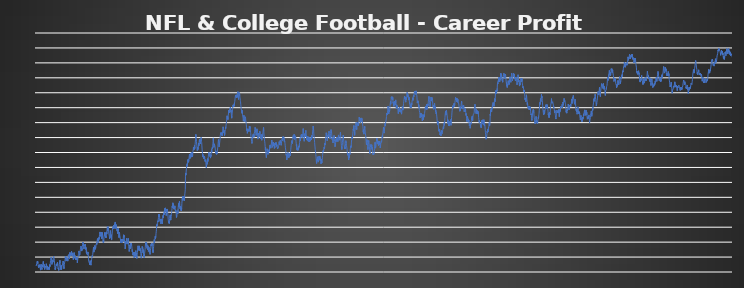
| Category | career profit |
|---|---|
| 0 | 0 |
| 1 | -1100 |
| 2 | 900 |
| 3 | 3900 |
| 4 | 5900 |
| 5 | 5900 |
| 6 | 7900 |
| 7 | 4600 |
| 8 | 7600 |
| 9 | 5400 |
| 10 | 2100 |
| 11 | -900 |
| 12 | -900 |
| 13 | -2900 |
| 14 | -1990.91 |
| 15 | 1645.45 |
| 16 | -854.55 |
| 17 | 2145.45 |
| 18 | -1154.55 |
| 19 | 845.45 |
| 20 | -2454.55 |
| 21 | -3554.55 |
| 22 | -6854.55 |
| 23 | -2854.55 |
| 24 | 1145.45 |
| 25 | 3145.45 |
| 26 | -154.55 |
| 27 | 845.45 |
| 28 | -3554.55 |
| 29 | -6054.55 |
| 30 | -3054.55 |
| 31 | 945.45 |
| 32 | -1254.55 |
| 33 | 1745.45 |
| 34 | 2745.45 |
| 35 | 5745.45 |
| 36 | 7745.45 |
| 37 | 3345.45 |
| 38 | 1145.45 |
| 39 | -2354.55 |
| 40 | -536.37 |
| 41 | 2645.45 |
| 42 | -1854.55 |
| 43 | -5854.55 |
| 44 | -3581.82 |
| 45 | -1763.64 |
| 46 | 54.54 |
| 47 | -1045.46 |
| 48 | -45.46 |
| 49 | -2545.46 |
| 50 | 181.81 |
| 51 | 3818.17 |
| 52 | 818.17 |
| 53 | -181.83 |
| 54 | -3181.83 |
| 55 | -6181.83 |
| 56 | -2090.92 |
| 57 | 181.81 |
| 58 | 1545.45 |
| 59 | -1454.55 |
| 60 | -5454.55 |
| 61 | -1818.19 |
| 62 | -4818.19 |
| 63 | -1636.37 |
| 64 | -3136.37 |
| 65 | -6136.37 |
| 66 | -5227.28 |
| 67 | -1590.92 |
| 68 | 2499.99 |
| 69 | -1000.01 |
| 70 | 2049.99 |
| 71 | 4658.69 |
| 72 | 9204.14 |
| 73 | 9204.14 |
| 74 | 10567.78 |
| 75 | 14658.69 |
| 76 | 13658.69 |
| 77 | 10158.69 |
| 78 | 6658.69 |
| 79 | 2658.69 |
| 80 | 5385.96 |
| 81 | 8429.44 |
| 82 | 5929.44 |
| 83 | 9565.8 |
| 84 | 6565.8 |
| 85 | 11111.25 |
| 86 | 14920.77 |
| 87 | 13420.77 |
| 88 | 16602.59 |
| 89 | 17511.68 |
| 90 | 12511.68 |
| 91 | 9511.68 |
| 92 | 5011.68 |
| 93 | 1011.68 |
| 94 | -1988.32 |
| 95 | -5988.32 |
| 96 | -3715.59 |
| 97 | -5715.59 |
| 98 | -1624.68 |
| 99 | -624.68 |
| 100 | -624.68 |
| 101 | 3011.68 |
| 102 | 4375.32 |
| 103 | 375.32 |
| 104 | 1738.96 |
| 105 | 4466.23 |
| 106 | 5466.23 |
| 107 | 6375.32 |
| 108 | 1375.32 |
| 109 | -1924.68 |
| 110 | -4924.68 |
| 111 | -5424.68 |
| 112 | -3224.68 |
| 113 | -7224.68 |
| 114 | -4497.41 |
| 115 | -1315.59 |
| 116 | 2775.32 |
| 117 | 3684.41 |
| 118 | 6866.23 |
| 119 | 9593.5 |
| 120 | 4593.5 |
| 121 | 1093.5 |
| 122 | -1906.5 |
| 123 | -5906.5 |
| 124 | -2724.68 |
| 125 | 1366.23 |
| 126 | -2633.77 |
| 127 | -6133.77 |
| 128 | -2497.41 |
| 129 | -697.41 |
| 130 | -1197.41 |
| 131 | 1802.59 |
| 132 | 802.59 |
| 133 | 1802.59 |
| 134 | 5893.5 |
| 135 | 8393.5 |
| 136 | 4393.5 |
| 137 | 1393.5 |
| 138 | 393.5 |
| 139 | -4606.5 |
| 140 | -796.98 |
| 141 | 2384.84 |
| 142 | 5269.46 |
| 143 | 4169.46 |
| 144 | 7943.04 |
| 145 | 12033.95 |
| 146 | 15670.31 |
| 147 | 12670.31 |
| 148 | 15852.13 |
| 149 | 11852.13 |
| 150 | 8352.13 |
| 151 | 11079.4 |
| 152 | 10079.4 |
| 153 | 14104.4 |
| 154 | 9604.4 |
| 155 | 12521.07 |
| 156 | 9521.07 |
| 157 | 12248.34 |
| 158 | 8248.34 |
| 159 | 11884.7 |
| 160 | 14611.97 |
| 161 | 17793.79 |
| 162 | 15293.79 |
| 163 | 18997.49 |
| 164 | 16997.49 |
| 165 | 15497.49 |
| 166 | 11997.49 |
| 167 | 16088.4 |
| 168 | 19724.76 |
| 169 | 22906.58 |
| 170 | 18406.58 |
| 171 | 21588.4 |
| 172 | 17588.4 |
| 173 | 20392.14 |
| 174 | 21301.23 |
| 175 | 17801.23 |
| 176 | 20801.23 |
| 177 | 24892.14 |
| 178 | 20392.14 |
| 179 | 17892.14 |
| 180 | 21983.05 |
| 181 | 20983.05 |
| 182 | 17483.05 |
| 183 | 21119.41 |
| 184 | 17119.41 |
| 185 | 13619.41 |
| 186 | 10619.41 |
| 187 | 15164.86 |
| 188 | 16528.5 |
| 189 | 18478.5 |
| 190 | 22569.41 |
| 191 | 18069.41 |
| 192 | 14769.41 |
| 193 | 18405.77 |
| 194 | 14405.77 |
| 195 | 12405.77 |
| 196 | 16496.68 |
| 197 | 13496.68 |
| 198 | 10496.68 |
| 199 | 14133.04 |
| 200 | 11133.04 |
| 201 | 14314.86 |
| 202 | 14314.86 |
| 203 | 10314.86 |
| 204 | 14405.77 |
| 205 | 10005.77 |
| 206 | 5505.77 |
| 207 | 8687.59 |
| 208 | 10137.59 |
| 209 | 12657.59 |
| 210 | 15657.59 |
| 211 | 18990.92 |
| 212 | 17990.92 |
| 213 | 21172.74 |
| 214 | 25263.65 |
| 215 | 22263.65 |
| 216 | 22263.65 |
| 217 | 17863.65 |
| 218 | 16863.65 |
| 219 | 20500.01 |
| 220 | 24136.37 |
| 221 | 27318.19 |
| 222 | 27318.19 |
| 223 | 30318.19 |
| 224 | 33318.19 |
| 225 | 34518.19 |
| 226 | 29518.19 |
| 227 | 25018.19 |
| 228 | 28684.86 |
| 229 | 26184.86 |
| 230 | 30275.77 |
| 231 | 33457.59 |
| 232 | 32457.59 |
| 233 | 36062.59 |
| 234 | 40153.5 |
| 235 | 36853.5 |
| 236 | 33353.5 |
| 237 | 36853.5 |
| 238 | 32853.5 |
| 239 | 28353.5 |
| 240 | 32353.5 |
| 241 | 33717.14 |
| 242 | 33717.14 |
| 243 | 31717.14 |
| 244 | 35808.05 |
| 245 | 33608.05 |
| 246 | 36789.87 |
| 247 | 32289.87 |
| 248 | 27889.87 |
| 249 | 31071.69 |
| 250 | 26571.69 |
| 251 | 22571.69 |
| 252 | 25753.51 |
| 253 | 20253.51 |
| 254 | 21253.51 |
| 255 | 20253.51 |
| 256 | 19253.51 |
| 257 | 18253.51 |
| 258 | 20526.24 |
| 259 | 23526.24 |
| 260 | 20226.24 |
| 261 | 16226.24 |
| 262 | 12226.24 |
| 263 | 7826.24 |
| 264 | 6726.24 |
| 265 | 8998.97 |
| 266 | 7398.97 |
| 267 | 4098.97 |
| 268 | 1898.97 |
| 269 | 5898.97 |
| 270 | 9080.79 |
| 271 | 4580.79 |
| 272 | 4580.79 |
| 273 | 5830.79 |
| 274 | 1430.79 |
| 275 | 4430.79 |
| 276 | 6703.52 |
| 277 | 10703.52 |
| 278 | 11703.52 |
| 279 | 14430.79 |
| 280 | 17430.79 |
| 281 | 15430.79 |
| 282 | 17430.79 |
| 283 | 19430.79 |
| 284 | 23430.79 |
| 285 | 26612.61 |
| 286 | 27612.61 |
| 287 | 31612.61 |
| 288 | 27612.61 |
| 289 | 23212.61 |
| 290 | 27212.61 |
| 291 | 28212.61 |
| 292 | 31394.43 |
| 293 | 34394.43 |
| 294 | 32194.43 |
| 295 | 27694.43 |
| 296 | 31694.43 |
| 297 | 29694.43 |
| 298 | 32694.43 |
| 299 | 32694.43 |
| 300 | 36361.1 |
| 301 | 35261.1 |
| 302 | 38261.1 |
| 303 | 36061.1 |
| 304 | 40061.1 |
| 305 | 42977.77 |
| 306 | 43977.77 |
| 307 | 46061.1 |
| 308 | 41661.1 |
| 309 | 44661.1 |
| 310 | 41361.1 |
| 311 | 39161.1 |
| 312 | 42494.43 |
| 313 | 47494.43 |
| 314 | 44494.43 |
| 315 | 45694.43 |
| 316 | 49027.76 |
| 317 | 53027.76 |
| 318 | 53027.76 |
| 319 | 57027.76 |
| 320 | 53027.76 |
| 321 | 51927.76 |
| 322 | 49727.76 |
| 323 | 48227.76 |
| 324 | 53227.76 |
| 325 | 56864.12 |
| 326 | 53864.12 |
| 327 | 48864.12 |
| 328 | 45564.12 |
| 329 | 49564.12 |
| 330 | 52564.12 |
| 331 | 56200.48 |
| 332 | 51800.48 |
| 333 | 46800.48 |
| 334 | 43500.48 |
| 335 | 39500.48 |
| 336 | 42500.48 |
| 337 | 39200.48 |
| 338 | 43200.48 |
| 339 | 47745.93 |
| 340 | 48745.93 |
| 341 | 52382.29 |
| 342 | 55382.29 |
| 343 | 51382.29 |
| 344 | 56382.29 |
| 345 | 52882.29 |
| 346 | 48482.29 |
| 347 | 47482.29 |
| 348 | 50482.29 |
| 349 | 46982.29 |
| 350 | 50982.29 |
| 351 | 53982.29 |
| 352 | 55982.29 |
| 353 | 53482.29 |
| 354 | 58027.74 |
| 355 | 62027.74 |
| 356 | 65027.74 |
| 357 | 59527.74 |
| 358 | 63164.1 |
| 359 | 66164.1 |
| 360 | 61764.1 |
| 361 | 64764.1 |
| 362 | 60364.1 |
| 363 | 54864.1 |
| 364 | 53864.1 |
| 365 | 51664.1 |
| 366 | 49464.1 |
| 367 | 45464.1 |
| 368 | 48380.77 |
| 369 | 51380.77 |
| 370 | 55380.77 |
| 371 | 59380.77 |
| 372 | 56080.77 |
| 373 | 51680.77 |
| 374 | 47280.77 |
| 375 | 52280.77 |
| 376 | 48280.77 |
| 377 | 43480.77 |
| 378 | 47480.77 |
| 379 | 51480.77 |
| 380 | 55117.13 |
| 381 | 60117.13 |
| 382 | 58617.13 |
| 383 | 62253.49 |
| 384 | 65889.85 |
| 385 | 62389.85 |
| 386 | 64208.03 |
| 387 | 68408.03 |
| 388 | 63908.03 |
| 389 | 67908.03 |
| 390 | 62908.03 |
| 391 | 66908.03 |
| 392 | 70544.39 |
| 393 | 67244.39 |
| 394 | 70577.72 |
| 395 | 73759.54 |
| 396 | 69259.54 |
| 397 | 67059.54 |
| 398 | 62659.54 |
| 399 | 66295.9 |
| 400 | 65295.9 |
| 401 | 69295.9 |
| 402 | 65795.9 |
| 403 | 61395.9 |
| 404 | 59395.9 |
| 405 | 61395.9 |
| 406 | 58095.9 |
| 407 | 54095.9 |
| 408 | 57732.26 |
| 409 | 61368.62 |
| 410 | 63368.62 |
| 411 | 57868.62 |
| 412 | 56868.62 |
| 413 | 51868.62 |
| 414 | 47468.62 |
| 415 | 52468.62 |
| 416 | 56468.62 |
| 417 | 53968.62 |
| 418 | 50968.62 |
| 419 | 50968.62 |
| 420 | 46568.62 |
| 421 | 46568.62 |
| 422 | 43268.62 |
| 423 | 38868.62 |
| 424 | 42868.62 |
| 425 | 38868.62 |
| 426 | 41868.62 |
| 427 | 44868.62 |
| 428 | 39868.62 |
| 429 | 44868.62 |
| 430 | 43868.62 |
| 431 | 39468.62 |
| 432 | 41468.62 |
| 433 | 44468.62 |
| 434 | 41168.62 |
| 435 | 45168.62 |
| 436 | 49335.29 |
| 437 | 52335.29 |
| 438 | 47935.29 |
| 439 | 51571.65 |
| 440 | 47721.65 |
| 441 | 43721.65 |
| 442 | 39721.65 |
| 443 | 37521.65 |
| 444 | 33121.65 |
| 445 | 28721.65 |
| 446 | 31721.65 |
| 447 | 36721.65 |
| 448 | 41721.65 |
| 449 | 37221.65 |
| 450 | 40221.65 |
| 451 | 43403.47 |
| 452 | 46403.47 |
| 453 | 42003.47 |
| 454 | 42003.47 |
| 455 | 36503.47 |
| 456 | 35503.47 |
| 457 | 36503.47 |
| 458 | 38503.47 |
| 459 | 43503.47 |
| 460 | 46503.47 |
| 461 | 42103.47 |
| 462 | 36603.47 |
| 463 | 32203.47 |
| 464 | 28903.47 |
| 465 | 24403.47 |
| 466 | 27403.47 |
| 467 | 32403.47 |
| 468 | 35403.47 |
| 469 | 31903.47 |
| 470 | 28603.47 |
| 471 | 32603.47 |
| 472 | 35103.47 |
| 473 | 38436.8 |
| 474 | 34436.8 |
| 475 | 33436.8 |
| 476 | 38436.8 |
| 477 | 35136.8 |
| 478 | 34036.8 |
| 479 | 29036.8 |
| 480 | 24036.8 |
| 481 | 27036.8 |
| 482 | 22636.8 |
| 483 | 18236.8 |
| 484 | 19236.8 |
| 485 | 19236.8 |
| 486 | 18136.8 |
| 487 | 23136.8 |
| 488 | 18136.8 |
| 489 | 17136.8 |
| 490 | 13836.8 |
| 491 | 17836.8 |
| 492 | 21473.16 |
| 493 | 23473.16 |
| 494 | 19473.16 |
| 495 | 15073.16 |
| 496 | 20073.16 |
| 497 | 22800.43 |
| 498 | 25800.43 |
| 499 | 20800.43 |
| 500 | 18600.43 |
| 501 | 21600.43 |
| 502 | 17200.43 |
| 503 | 12700.43 |
| 504 | 15700.43 |
| 505 | 19700.43 |
| 506 | 22800.43 |
| 507 | 26800.43 |
| 508 | 30800.43 |
| 509 | 33800.43 |
| 510 | 28300.43 |
| 511 | 26300.43 |
| 512 | 30300.43 |
| 513 | 27000.43 |
| 514 | 30750.43 |
| 515 | 33750.43 |
| 516 | 29350.43 |
| 517 | 25750.43 |
| 518 | 30295.88 |
| 519 | 28095.88 |
| 520 | 25595.88 |
| 521 | 28595.88 |
| 522 | 24195.88 |
| 523 | 20895.88 |
| 524 | 17595.88 |
| 525 | 13195.88 |
| 526 | 17195.88 |
| 527 | 21195.88 |
| 528 | 24195.88 |
| 529 | 27832.24 |
| 530 | 32832.24 |
| 531 | 28432.24 |
| 532 | 31432.24 |
| 533 | 27832.24 |
| 534 | 22332.24 |
| 535 | 27332.24 |
| 536 | 21832.24 |
| 537 | 19832.24 |
| 538 | 14832.24 |
| 539 | 18832.24 |
| 540 | 14432.24 |
| 541 | 18432.24 |
| 542 | 21614.06 |
| 543 | 22614.06 |
| 544 | 27197.39 |
| 545 | 30833.75 |
| 546 | 35833.75 |
| 547 | 38833.75 |
| 548 | 35533.75 |
| 549 | 40117.08 |
| 550 | 37917.08 |
| 551 | 33517.08 |
| 552 | 38100.41 |
| 553 | 34800.41 |
| 554 | 29580.41 |
| 555 | 34580.41 |
| 556 | 31280.41 |
| 557 | 26880.41 |
| 558 | 30880.41 |
| 559 | 33880.41 |
| 560 | 28380.41 |
| 561 | 24380.41 |
| 562 | 25380.41 |
| 563 | 28380.41 |
| 564 | 31297.08 |
| 565 | 27297.08 |
| 566 | 22897.08 |
| 567 | 26897.08 |
| 568 | 23897.08 |
| 569 | 19497.08 |
| 570 | 22497.08 |
| 571 | 26306.6 |
| 572 | 29223.27 |
| 573 | 31723.27 |
| 574 | 36268.72 |
| 575 | 33768.72 |
| 576 | 35132.36 |
| 577 | 38282.36 |
| 578 | 34982.36 |
| 579 | 37709.63 |
| 580 | 33709.63 |
| 581 | 28209.63 |
| 582 | 24909.63 |
| 583 | 26909.63 |
| 584 | 22409.63 |
| 585 | 26409.63 |
| 586 | 28809.63 |
| 587 | 32809.63 |
| 588 | 37159.63 |
| 589 | 40492.96 |
| 590 | 44242.96 |
| 591 | 38742.96 |
| 592 | 41351.66 |
| 593 | 44351.66 |
| 594 | 46434.99 |
| 595 | 49768.32 |
| 596 | 45268.32 |
| 597 | 46268.32 |
| 598 | 49601.65 |
| 599 | 54601.65 |
| 600 | 57351.65 |
| 601 | 61351.65 |
| 602 | 65264.69 |
| 603 | 69264.69 |
| 604 | 66764.69 |
| 605 | 70401.05 |
| 606 | 72401.05 |
| 607 | 75401.05 |
| 608 | 76851.05 |
| 609 | 73551.05 |
| 610 | 77551.05 |
| 611 | 80951.05 |
| 612 | 85951.05 |
| 613 | 82651.05 |
| 614 | 87051.05 |
| 615 | 83751.05 |
| 616 | 85751.05 |
| 617 | 81351.05 |
| 618 | 76851.05 |
| 619 | 74651.05 |
| 620 | 78564.09 |
| 621 | 80064.09 |
| 622 | 76064.09 |
| 623 | 70564.09 |
| 624 | 69564.09 |
| 625 | 73655 |
| 626 | 72555 |
| 627 | 75282.27 |
| 628 | 78918.63 |
| 629 | 74918.63 |
| 630 | 70418.63 |
| 631 | 75001.96 |
| 632 | 77085.29 |
| 633 | 80721.65 |
| 634 | 84721.65 |
| 635 | 80721.65 |
| 636 | 84471.65 |
| 637 | 86871.65 |
| 638 | 88871.65 |
| 639 | 85571.65 |
| 640 | 90117.1 |
| 641 | 91367.1 |
| 642 | 96367.1 |
| 643 | 94867.1 |
| 644 | 90367.1 |
| 645 | 95367.1 |
| 646 | 97367.1 |
| 647 | 92967.1 |
| 648 | 91967.1 |
| 649 | 88467.1 |
| 650 | 84467.1 |
| 651 | 88467.1 |
| 652 | 92380.14 |
| 653 | 94880.14 |
| 654 | 90480.14 |
| 655 | 95480.14 |
| 656 | 91980.14 |
| 657 | 90880.14 |
| 658 | 86880.14 |
| 659 | 81880.14 |
| 660 | 77480.14 |
| 661 | 76480.14 |
| 662 | 72080.14 |
| 663 | 72080.14 |
| 664 | 75080.14 |
| 665 | 71080.14 |
| 666 | 75663.47 |
| 667 | 79737.54 |
| 668 | 83737.54 |
| 669 | 83737.54 |
| 670 | 85737.54 |
| 671 | 80237.54 |
| 672 | 76737.54 |
| 673 | 75637.54 |
| 674 | 78970.87 |
| 675 | 83070.87 |
| 676 | 86070.87 |
| 677 | 89707.23 |
| 678 | 93507.23 |
| 679 | 96507.23 |
| 680 | 100507.23 |
| 681 | 97207.23 |
| 682 | 102207.23 |
| 683 | 105843.59 |
| 684 | 104743.59 |
| 685 | 100343.59 |
| 686 | 104093.59 |
| 687 | 99693.59 |
| 688 | 95693.59 |
| 689 | 99443.59 |
| 690 | 95043.59 |
| 691 | 95043.59 |
| 692 | 97043.59 |
| 693 | 100679.95 |
| 694 | 97379.95 |
| 695 | 96379.95 |
| 696 | 90879.95 |
| 697 | 93879.95 |
| 698 | 95429.95 |
| 699 | 91029.95 |
| 700 | 85529.95 |
| 701 | 81229.95 |
| 702 | 80229.95 |
| 703 | 84229.95 |
| 704 | 88229.95 |
| 705 | 92229.95 |
| 706 | 87229.95 |
| 707 | 91229.95 |
| 708 | 87929.95 |
| 709 | 94929.95 |
| 710 | 98929.95 |
| 711 | 102111.77 |
| 712 | 104839.04 |
| 713 | 99339.04 |
| 714 | 102672.37 |
| 715 | 106672.37 |
| 716 | 108572.37 |
| 717 | 105272.37 |
| 718 | 101272.37 |
| 719 | 95772.37 |
| 720 | 99772.37 |
| 721 | 95372.37 |
| 722 | 99372.37 |
| 723 | 98372.37 |
| 724 | 92872.37 |
| 725 | 96872.37 |
| 726 | 92472.37 |
| 727 | 97017.82 |
| 728 | 104317.82 |
| 729 | 109317.82 |
| 730 | 113317.82 |
| 731 | 110017.82 |
| 732 | 113017.82 |
| 733 | 117017.82 |
| 734 | 112617.82 |
| 735 | 116254.18 |
| 736 | 112954.18 |
| 737 | 115954.18 |
| 738 | 110454.18 |
| 739 | 113454.18 |
| 740 | 108954.18 |
| 741 | 112954.18 |
| 742 | 116954.18 |
| 743 | 120954.18 |
| 744 | 123954.18 |
| 745 | 127954.18 |
| 746 | 150454.18 |
| 747 | 155454.18 |
| 748 | 152154.18 |
| 749 | 156154.18 |
| 750 | 160699.63 |
| 751 | 163699.63 |
| 752 | 166219.63 |
| 753 | 167219.63 |
| 754 | 171219.63 |
| 755 | 166819.63 |
| 756 | 169819.63 |
| 757 | 174819.63 |
| 758 | 177819.63 |
| 759 | 173419.63 |
| 760 | 178419.63 |
| 761 | 174019.63 |
| 762 | 173019.63 |
| 763 | 176352.96 |
| 764 | 181352.96 |
| 765 | 184352.96 |
| 766 | 187352.96 |
| 767 | 185152.96 |
| 768 | 179652.96 |
| 769 | 178152.96 |
| 770 | 182152.96 |
| 771 | 185069.63 |
| 772 | 181769.63 |
| 773 | 186769.63 |
| 774 | 189496.9 |
| 775 | 185496.9 |
| 776 | 188496.9 |
| 777 | 182996.9 |
| 778 | 186746.9 |
| 779 | 190746.9 |
| 780 | 186546.9 |
| 781 | 182546.9 |
| 782 | 186546.9 |
| 783 | 191546.9 |
| 784 | 190546.9 |
| 785 | 194546.9 |
| 786 | 199046.9 |
| 787 | 195046.9 |
| 788 | 197046.9 |
| 789 | 194846.9 |
| 790 | 197846.9 |
| 791 | 201846.9 |
| 792 | 196346.9 |
| 793 | 199346.9 |
| 794 | 203346.9 |
| 795 | 207346.9 |
| 796 | 211346.9 |
| 797 | 215346.9 |
| 798 | 220346.9 |
| 799 | 216346.9 |
| 800 | 213046.9 |
| 801 | 208546.9 |
| 802 | 204146.9 |
| 803 | 201946.9 |
| 804 | 197546.9 |
| 805 | 193146.9 |
| 806 | 194146.9 |
| 807 | 199146.9 |
| 808 | 194746.9 |
| 809 | 194746.9 |
| 810 | 197746.9 |
| 811 | 202746.9 |
| 812 | 205746.9 |
| 813 | 201346.9 |
| 814 | 206346.9 |
| 815 | 210346.9 |
| 816 | 212346.9 |
| 817 | 207946.9 |
| 818 | 211946.9 |
| 819 | 209746.9 |
| 820 | 204246.9 |
| 821 | 208246.9 |
| 822 | 208246.9 |
| 823 | 211246.9 |
| 824 | 215246.9 |
| 825 | 213046.9 |
| 826 | 208646.9 |
| 827 | 206446.9 |
| 828 | 201046.9 |
| 829 | 195546.9 |
| 830 | 192246.9 |
| 831 | 187846.9 |
| 832 | 182846.9 |
| 833 | 186846.9 |
| 834 | 183846.9 |
| 835 | 183846.9 |
| 836 | 180846.9 |
| 837 | 183846.9 |
| 838 | 179346.9 |
| 839 | 183346.9 |
| 840 | 180046.9 |
| 841 | 184046.9 |
| 842 | 180746.9 |
| 843 | 175246.9 |
| 844 | 174246.9 |
| 845 | 177290.38 |
| 846 | 175090.38 |
| 847 | 178090.38 |
| 848 | 173590.38 |
| 849 | 168090.38 |
| 850 | 164790.38 |
| 851 | 165790.38 |
| 852 | 169790.38 |
| 853 | 172790.38 |
| 854 | 174790.38 |
| 855 | 170390.38 |
| 856 | 175390.38 |
| 857 | 179973.71 |
| 858 | 174973.71 |
| 859 | 178973.71 |
| 860 | 182973.71 |
| 861 | 185973.71 |
| 862 | 189973.71 |
| 863 | 188973.71 |
| 864 | 189883.71 |
| 865 | 189883.71 |
| 866 | 185483.71 |
| 867 | 189483.71 |
| 868 | 186183.71 |
| 869 | 182883.71 |
| 870 | 186183.71 |
| 871 | 180683.71 |
| 872 | 185683.71 |
| 873 | 183483.71 |
| 874 | 186483.71 |
| 875 | 191483.71 |
| 876 | 194983.71 |
| 877 | 189983.71 |
| 878 | 192983.71 |
| 879 | 197983.71 |
| 880 | 196983.71 |
| 881 | 195983.71 |
| 882 | 199733.71 |
| 883 | 204733.71 |
| 884 | 207933.71 |
| 885 | 214423.71 |
| 886 | 207923.71 |
| 887 | 201923.71 |
| 888 | 198623.71 |
| 889 | 200623.71 |
| 890 | 204536.75 |
| 891 | 205786.75 |
| 892 | 201286.75 |
| 893 | 201286.75 |
| 894 | 199086.75 |
| 895 | 194086.75 |
| 896 | 192986.75 |
| 897 | 189686.75 |
| 898 | 192686.75 |
| 899 | 188286.75 |
| 900 | 190286.75 |
| 901 | 186986.75 |
| 902 | 190320.08 |
| 903 | 187320.08 |
| 904 | 189320.08 |
| 905 | 192320.08 |
| 906 | 194070.08 |
| 907 | 198070.08 |
| 908 | 200070.08 |
| 909 | 204653.41 |
| 910 | 208653.41 |
| 911 | 211653.41 |
| 912 | 209453.41 |
| 913 | 206153.41 |
| 914 | 199553.41 |
| 915 | 201553.41 |
| 916 | 203220.08 |
| 917 | 207386.75 |
| 918 | 210386.75 |
| 919 | 213386.75 |
| 920 | 218386.75 |
| 921 | 220386.75 |
| 922 | 219386.75 |
| 923 | 223386.75 |
| 924 | 220086.75 |
| 925 | 218986.75 |
| 926 | 221986.75 |
| 927 | 222986.75 |
| 928 | 218486.75 |
| 929 | 223486.75 |
| 930 | 217986.75 |
| 931 | 221986.75 |
| 932 | 225986.75 |
| 933 | 229986.75 |
| 934 | 232986.75 |
| 935 | 229686.75 |
| 936 | 226386.75 |
| 937 | 223086.75 |
| 938 | 225086.75 |
| 939 | 227170.08 |
| 940 | 221670.08 |
| 941 | 218370.08 |
| 942 | 217370.08 |
| 943 | 222370.08 |
| 944 | 225370.08 |
| 945 | 228370.08 |
| 946 | 232370.08 |
| 947 | 230170.08 |
| 948 | 233503.41 |
| 949 | 234503.41 |
| 950 | 238503.41 |
| 951 | 241503.41 |
| 952 | 244503.41 |
| 953 | 247503.41 |
| 954 | 251503.41 |
| 955 | 246003.41 |
| 956 | 248177.32 |
| 957 | 249177.32 |
| 958 | 245177.32 |
| 959 | 249177.32 |
| 960 | 252093.99 |
| 961 | 256876.6 |
| 962 | 260876.6 |
| 963 | 256376.6 |
| 964 | 260376.6 |
| 965 | 257076.6 |
| 966 | 259876.6 |
| 967 | 259876.6 |
| 968 | 262876.6 |
| 969 | 264876.6 |
| 970 | 261576.6 |
| 971 | 265326.6 |
| 972 | 262026.6 |
| 973 | 257626.6 |
| 974 | 260626.6 |
| 975 | 255126.6 |
| 976 | 249626.6 |
| 977 | 247426.6 |
| 978 | 251426.6 |
| 979 | 254626.6 |
| 980 | 257626.6 |
| 981 | 261626.6 |
| 982 | 264626.6 |
| 983 | 269626.6 |
| 984 | 268626.6 |
| 985 | 269626.6 |
| 986 | 269626.6 |
| 987 | 266126.6 |
| 988 | 269459.93 |
| 989 | 271459.93 |
| 990 | 268159.93 |
| 991 | 272942.54 |
| 992 | 274942.54 |
| 993 | 277942.54 |
| 994 | 280859.21 |
| 995 | 281859.21 |
| 996 | 286025.88 |
| 997 | 282725.88 |
| 998 | 282725.88 |
| 999 | 284725.88 |
| 1000 | 286725.88 |
| 1001 | 286725.88 |
| 1002 | 281225.88 |
| 1003 | 282225.88 |
| 1004 | 286225.88 |
| 1005 | 282925.88 |
| 1006 | 286925.88 |
| 1007 | 289925.88 |
| 1008 | 291925.88 |
| 1009 | 287525.88 |
| 1010 | 284225.88 |
| 1011 | 278725.88 |
| 1012 | 283725.88 |
| 1013 | 286453.15 |
| 1014 | 290453.15 |
| 1015 | 287153.15 |
| 1016 | 289253.15 |
| 1017 | 284853.15 |
| 1018 | 282653.15 |
| 1019 | 282653.15 |
| 1020 | 277153.15 |
| 1021 | 274953.15 |
| 1022 | 270553.15 |
| 1023 | 267253.15 |
| 1024 | 263953.15 |
| 1025 | 262953.15 |
| 1026 | 259653.15 |
| 1027 | 258653.15 |
| 1028 | 255653.15 |
| 1029 | 260653.15 |
| 1030 | 257653.15 |
| 1031 | 253253.15 |
| 1032 | 254253.15 |
| 1033 | 249253.15 |
| 1034 | 246753.15 |
| 1035 | 242353.15 |
| 1036 | 244353.15 |
| 1037 | 247353.15 |
| 1038 | 252353.15 |
| 1039 | 247953.15 |
| 1040 | 246953.15 |
| 1041 | 244953.15 |
| 1042 | 241653.15 |
| 1043 | 244986.48 |
| 1044 | 247986.48 |
| 1045 | 249686.48 |
| 1046 | 247486.48 |
| 1047 | 244186.48 |
| 1048 | 243186.48 |
| 1049 | 238786.48 |
| 1050 | 236786.48 |
| 1051 | 231286.48 |
| 1052 | 226886.48 |
| 1053 | 229803.15 |
| 1054 | 226503.15 |
| 1055 | 222103.15 |
| 1056 | 224103.15 |
| 1057 | 228103.15 |
| 1058 | 226603.15 |
| 1059 | 229603.15 |
| 1060 | 227403.15 |
| 1061 | 226403.15 |
| 1062 | 228403.15 |
| 1063 | 225103.15 |
| 1064 | 230103.15 |
| 1065 | 234016.19 |
| 1066 | 231816.19 |
| 1067 | 228516.19 |
| 1068 | 233516.19 |
| 1069 | 230216.19 |
| 1070 | 228216.19 |
| 1071 | 223816.19 |
| 1072 | 221616.19 |
| 1073 | 217116.19 |
| 1074 | 216116.19 |
| 1075 | 212816.19 |
| 1076 | 211716.19 |
| 1077 | 208216.19 |
| 1078 | 205216.19 |
| 1079 | 207216.19 |
| 1080 | 211799.52 |
| 1081 | 215799.52 |
| 1082 | 219299.52 |
| 1083 | 219299.52 |
| 1084 | 220299.52 |
| 1085 | 221299.52 |
| 1086 | 215799.52 |
| 1087 | 218799.52 |
| 1088 | 215499.52 |
| 1089 | 217499.52 |
| 1090 | 221499.52 |
| 1091 | 225499.52 |
| 1092 | 224999.52 |
| 1093 | 228999.52 |
| 1094 | 231999.52 |
| 1095 | 229499.52 |
| 1096 | 223999.52 |
| 1097 | 222899.52 |
| 1098 | 221799.52 |
| 1099 | 218499.52 |
| 1100 | 223499.52 |
| 1101 | 225499.52 |
| 1102 | 227673.43 |
| 1103 | 229673.43 |
| 1104 | 230673.43 |
| 1105 | 223173.43 |
| 1106 | 218873.43 |
| 1107 | 216673.43 |
| 1108 | 212373.43 |
| 1109 | 215290.1 |
| 1110 | 218290.1 |
| 1111 | 222290.1 |
| 1112 | 220090.1 |
| 1113 | 215490.1 |
| 1114 | 218490.1 |
| 1115 | 219671.92 |
| 1116 | 220671.92 |
| 1117 | 225671.92 |
| 1118 | 224671.92 |
| 1119 | 222471.92 |
| 1120 | 217071.92 |
| 1121 | 212571.92 |
| 1122 | 211471.92 |
| 1123 | 216254.53 |
| 1124 | 218254.53 |
| 1125 | 220337.86 |
| 1126 | 214837.86 |
| 1127 | 210437.86 |
| 1128 | 212437.86 |
| 1129 | 215437.86 |
| 1130 | 219437.86 |
| 1131 | 215037.86 |
| 1132 | 220492.41 |
| 1133 | 223492.41 |
| 1134 | 226992.41 |
| 1135 | 227992.41 |
| 1136 | 231992.41 |
| 1137 | 225492.41 |
| 1138 | 221092.41 |
| 1139 | 216692.41 |
| 1140 | 212292.41 |
| 1141 | 213292.41 |
| 1142 | 207792.41 |
| 1143 | 204492.41 |
| 1144 | 199692.41 |
| 1145 | 194292.41 |
| 1146 | 198292.41 |
| 1147 | 192792.41 |
| 1148 | 187292.41 |
| 1149 | 183992.41 |
| 1150 | 181492.41 |
| 1151 | 185310.59 |
| 1152 | 188310.59 |
| 1153 | 191810.59 |
| 1154 | 196210.59 |
| 1155 | 192710.59 |
| 1156 | 189410.59 |
| 1157 | 191410.59 |
| 1158 | 187010.59 |
| 1159 | 187010.59 |
| 1160 | 190010.59 |
| 1161 | 193010.59 |
| 1162 | 191810.59 |
| 1163 | 190710.59 |
| 1164 | 194710.59 |
| 1165 | 192310.59 |
| 1166 | 197310.59 |
| 1167 | 200310.59 |
| 1168 | 202310.59 |
| 1169 | 197910.59 |
| 1170 | 202683.32 |
| 1171 | 200683.32 |
| 1172 | 197183.32 |
| 1173 | 200183.32 |
| 1174 | 201683.32 |
| 1175 | 203733.32 |
| 1176 | 207733.32 |
| 1177 | 210733.32 |
| 1178 | 207433.32 |
| 1179 | 201933.32 |
| 1180 | 198633.32 |
| 1181 | 201633.32 |
| 1182 | 204633.32 |
| 1183 | 202983.32 |
| 1184 | 207566.65 |
| 1185 | 204266.65 |
| 1186 | 206266.65 |
| 1187 | 200766.65 |
| 1188 | 205549.26 |
| 1189 | 201149.26 |
| 1190 | 196749.26 |
| 1191 | 199931.08 |
| 1192 | 197731.08 |
| 1193 | 201821.99 |
| 1194 | 205458.35 |
| 1195 | 206458.35 |
| 1196 | 205358.35 |
| 1197 | 202858.35 |
| 1198 | 206858.35 |
| 1199 | 208508.35 |
| 1200 | 203008.35 |
| 1201 | 200258.35 |
| 1202 | 203258.35 |
| 1203 | 203258.35 |
| 1204 | 200258.35 |
| 1205 | 198058.35 |
| 1206 | 196058.35 |
| 1207 | 194708.35 |
| 1208 | 196708.35 |
| 1209 | 197708.35 |
| 1210 | 199708.35 |
| 1211 | 201058.35 |
| 1212 | 202058.35 |
| 1213 | 203058.35 |
| 1214 | 208058.35 |
| 1215 | 204758.35 |
| 1216 | 202558.35 |
| 1217 | 205058.35 |
| 1218 | 207558.35 |
| 1219 | 210058.35 |
| 1220 | 206758.35 |
| 1221 | 209758.35 |
| 1222 | 209758.35 |
| 1223 | 205358.35 |
| 1224 | 202058.35 |
| 1225 | 205058.35 |
| 1226 | 208058.35 |
| 1227 | 206958.35 |
| 1228 | 209958.35 |
| 1229 | 212958.35 |
| 1230 | 209658.35 |
| 1231 | 212658.35 |
| 1232 | 215658.35 |
| 1233 | 212658.35 |
| 1234 | 216658.35 |
| 1235 | 215558.35 |
| 1236 | 212258.35 |
| 1237 | 215258.35 |
| 1238 | 213058.35 |
| 1239 | 208658.35 |
| 1240 | 211658.35 |
| 1241 | 210558.35 |
| 1242 | 207558.35 |
| 1243 | 205358.35 |
| 1244 | 202058.35 |
| 1245 | 198758.35 |
| 1246 | 197108.35 |
| 1247 | 193608.35 |
| 1248 | 188108.35 |
| 1249 | 185358.35 |
| 1250 | 187358.35 |
| 1251 | 183058.35 |
| 1252 | 177558.35 |
| 1253 | 180558.35 |
| 1254 | 182058.35 |
| 1255 | 185101.83 |
| 1256 | 182101.83 |
| 1257 | 187101.83 |
| 1258 | 190101.83 |
| 1259 | 185701.83 |
| 1260 | 183501.83 |
| 1261 | 183501.83 |
| 1262 | 181001.83 |
| 1263 | 184001.83 |
| 1264 | 186918.5 |
| 1265 | 183618.5 |
| 1266 | 186800.32 |
| 1267 | 185700.32 |
| 1268 | 188700.32 |
| 1269 | 184300.32 |
| 1270 | 189082.93 |
| 1271 | 192082.93 |
| 1272 | 195082.93 |
| 1273 | 198995.97 |
| 1274 | 201995.97 |
| 1275 | 204995.97 |
| 1276 | 209995.97 |
| 1277 | 208995.97 |
| 1278 | 211268.7 |
| 1279 | 208268.7 |
| 1280 | 204968.7 |
| 1281 | 208968.7 |
| 1282 | 211968.7 |
| 1283 | 213273.05 |
| 1284 | 218273.05 |
| 1285 | 213873.05 |
| 1286 | 216873.05 |
| 1287 | 214673.05 |
| 1288 | 218673.05 |
| 1289 | 220673.05 |
| 1290 | 215173.05 |
| 1291 | 211873.05 |
| 1292 | 216873.05 |
| 1293 | 216873.05 |
| 1294 | 214873.05 |
| 1295 | 217873.05 |
| 1296 | 217873.05 |
| 1297 | 213373.05 |
| 1298 | 208973.05 |
| 1299 | 205673.05 |
| 1300 | 201273.05 |
| 1301 | 203273.05 |
| 1302 | 197773.05 |
| 1303 | 194473.05 |
| 1304 | 197549.97 |
| 1305 | 193549.97 |
| 1306 | 192449.97 |
| 1307 | 192449.97 |
| 1308 | 195449.97 |
| 1309 | 198449.97 |
| 1310 | 193949.97 |
| 1311 | 196949.97 |
| 1312 | 200949.97 |
| 1313 | 199949.97 |
| 1314 | 198849.97 |
| 1315 | 203849.97 |
| 1316 | 206849.97 |
| 1317 | 209849.97 |
| 1318 | 212849.97 |
| 1319 | 214849.97 |
| 1320 | 209349.97 |
| 1321 | 213440.88 |
| 1322 | 212440.88 |
| 1323 | 215622.7 |
| 1324 | 219622.7 |
| 1325 | 216322.7 |
| 1326 | 216322.7 |
| 1327 | 220322.7 |
| 1328 | 219322.7 |
| 1329 | 214922.7 |
| 1330 | 213922.7 |
| 1331 | 218922.7 |
| 1332 | 221922.7 |
| 1333 | 225922.7 |
| 1334 | 230013.61 |
| 1335 | 224513.61 |
| 1336 | 221213.61 |
| 1337 | 216713.61 |
| 1338 | 213213.61 |
| 1339 | 208813.61 |
| 1340 | 215138.61 |
| 1341 | 218138.61 |
| 1342 | 221616.87 |
| 1343 | 216116.87 |
| 1344 | 215116.87 |
| 1345 | 219116.87 |
| 1346 | 224116.87 |
| 1347 | 227116.87 |
| 1348 | 223116.87 |
| 1349 | 222016.87 |
| 1350 | 217616.87 |
| 1351 | 214316.87 |
| 1352 | 211016.87 |
| 1353 | 216016.87 |
| 1354 | 214516.87 |
| 1355 | 210116.87 |
| 1356 | 213116.87 |
| 1357 | 217116.87 |
| 1358 | 216116.87 |
| 1359 | 212816.87 |
| 1360 | 208316.87 |
| 1361 | 213316.87 |
| 1362 | 208916.87 |
| 1363 | 212916.87 |
| 1364 | 215416.87 |
| 1365 | 212116.87 |
| 1366 | 207716.87 |
| 1367 | 210716.87 |
| 1368 | 213716.87 |
| 1369 | 209316.87 |
| 1370 | 214316.87 |
| 1371 | 213316.87 |
| 1372 | 211116.87 |
| 1373 | 214033.54 |
| 1374 | 216033.54 |
| 1375 | 211033.54 |
| 1376 | 214033.54 |
| 1377 | 218758.54 |
| 1378 | 214358.54 |
| 1379 | 217358.54 |
| 1380 | 220358.54 |
| 1381 | 224358.54 |
| 1382 | 228358.54 |
| 1383 | 232358.54 |
| 1384 | 234358.54 |
| 1385 | 233258.54 |
| 1386 | 226758.54 |
| 1387 | 221258.54 |
| 1388 | 216858.54 |
| 1389 | 214658.54 |
| 1390 | 211358.54 |
| 1391 | 206958.54 |
| 1392 | 202558.54 |
| 1393 | 199258.54 |
| 1394 | 194858.54 |
| 1395 | 192658.54 |
| 1396 | 189658.54 |
| 1397 | 186658.54 |
| 1398 | 183358.54 |
| 1399 | 177858.54 |
| 1400 | 173858.54 |
| 1401 | 171658.54 |
| 1402 | 175658.54 |
| 1403 | 178658.54 |
| 1404 | 175908.54 |
| 1405 | 179908.54 |
| 1406 | 182908.54 |
| 1407 | 183908.54 |
| 1408 | 178408.54 |
| 1409 | 173908.54 |
| 1410 | 175158.54 |
| 1411 | 178158.54 |
| 1412 | 180158.54 |
| 1413 | 184158.54 |
| 1414 | 182658.54 |
| 1415 | 178258.54 |
| 1416 | 180758.54 |
| 1417 | 183758.54 |
| 1418 | 178258.54 |
| 1419 | 176258.54 |
| 1420 | 180983.54 |
| 1421 | 176483.54 |
| 1422 | 174283.54 |
| 1423 | 170983.54 |
| 1424 | 173983.54 |
| 1425 | 178983.54 |
| 1426 | 174583.54 |
| 1427 | 172383.54 |
| 1428 | 175383.54 |
| 1429 | 178983.54 |
| 1430 | 182027.02 |
| 1431 | 185027.02 |
| 1432 | 190027.02 |
| 1433 | 193027.02 |
| 1434 | 190827.02 |
| 1435 | 189727.02 |
| 1436 | 192627.02 |
| 1437 | 196627.02 |
| 1438 | 198627.02 |
| 1439 | 199627.02 |
| 1440 | 196327.02 |
| 1441 | 199327.02 |
| 1442 | 205762.02 |
| 1443 | 202462.02 |
| 1444 | 205462.02 |
| 1445 | 210462.02 |
| 1446 | 211462.02 |
| 1447 | 216462.02 |
| 1448 | 219462.02 |
| 1449 | 222940.28 |
| 1450 | 220740.28 |
| 1451 | 222740.28 |
| 1452 | 217240.28 |
| 1453 | 213940.28 |
| 1454 | 209540.28 |
| 1455 | 214123.61 |
| 1456 | 214123.61 |
| 1457 | 217123.61 |
| 1458 | 219123.61 |
| 1459 | 215823.61 |
| 1460 | 217823.61 |
| 1461 | 221823.61 |
| 1462 | 220823.61 |
| 1463 | 225823.61 |
| 1464 | 222523.61 |
| 1465 | 219223.61 |
| 1466 | 214823.61 |
| 1467 | 217823.61 |
| 1468 | 213423.61 |
| 1469 | 217336.65 |
| 1470 | 218336.65 |
| 1471 | 222336.65 |
| 1472 | 225336.65 |
| 1473 | 228336.65 |
| 1474 | 222836.65 |
| 1475 | 224836.65 |
| 1476 | 221836.65 |
| 1477 | 217436.65 |
| 1478 | 211936.65 |
| 1479 | 210936.65 |
| 1480 | 214936.65 |
| 1481 | 212186.65 |
| 1482 | 208886.65 |
| 1483 | 205886.65 |
| 1484 | 210886.65 |
| 1485 | 211886.65 |
| 1486 | 210786.65 |
| 1487 | 215569.26 |
| 1488 | 218569.26 |
| 1489 | 213069.26 |
| 1490 | 214069.26 |
| 1491 | 208569.26 |
| 1492 | 204169.26 |
| 1493 | 199669.26 |
| 1494 | 198669.26 |
| 1495 | 203669.26 |
| 1496 | 206669.26 |
| 1497 | 211669.26 |
| 1498 | 208169.26 |
| 1499 | 213169.26 |
| 1500 | 214169.26 |
| 1501 | 215169.26 |
| 1502 | 210769.26 |
| 1503 | 212769.26 |
| 1504 | 212769.26 |
| 1505 | 215769.26 |
| 1506 | 213569.26 |
| 1507 | 208069.26 |
| 1508 | 212069.26 |
| 1509 | 214069.26 |
| 1510 | 219409.07 |
| 1511 | 218309.07 |
| 1512 | 216109.07 |
| 1513 | 211709.07 |
| 1514 | 210609.07 |
| 1515 | 213942.4 |
| 1516 | 210642.4 |
| 1517 | 213642.4 |
| 1518 | 216642.4 |
| 1519 | 221642.4 |
| 1520 | 223642.4 |
| 1521 | 219242.4 |
| 1522 | 214842.4 |
| 1523 | 209342.4 |
| 1524 | 204942.4 |
| 1525 | 201642.4 |
| 1526 | 197242.4 |
| 1527 | 195042.4 |
| 1528 | 199392.4 |
| 1529 | 201892.4 |
| 1530 | 206892.4 |
| 1531 | 210892.4 |
| 1532 | 212492.4 |
| 1533 | 214992.4 |
| 1534 | 218992.4 |
| 1535 | 213492.4 |
| 1536 | 212392.4 |
| 1537 | 209092.4 |
| 1538 | 203592.4 |
| 1539 | 203112.4 |
| 1540 | 199112.4 |
| 1541 | 196112.4 |
| 1542 | 199112.4 |
| 1543 | 195812.4 |
| 1544 | 199812.4 |
| 1545 | 200812.4 |
| 1546 | 204812.4 |
| 1547 | 209812.4 |
| 1548 | 208712.4 |
| 1549 | 205412.4 |
| 1550 | 202112.4 |
| 1551 | 202112.4 |
| 1552 | 197712.4 |
| 1553 | 195512.4 |
| 1554 | 191012.4 |
| 1555 | 187712.4 |
| 1556 | 188712.4 |
| 1557 | 185412.4 |
| 1558 | 188412.4 |
| 1559 | 186212.4 |
| 1560 | 180712.4 |
| 1561 | 177412.4 |
| 1562 | 182412.4 |
| 1563 | 185412.4 |
| 1564 | 181012.4 |
| 1565 | 185012.4 |
| 1566 | 189012.4 |
| 1567 | 186812.4 |
| 1568 | 189812.4 |
| 1569 | 194812.4 |
| 1570 | 196812.4 |
| 1571 | 200812.4 |
| 1572 | 201812.4 |
| 1573 | 198512.4 |
| 1574 | 202512.4 |
| 1575 | 207512.4 |
| 1576 | 211512.4 |
| 1577 | 215798.11 |
| 1578 | 215798.11 |
| 1579 | 216707.2 |
| 1580 | 213407.2 |
| 1581 | 218407.2 |
| 1582 | 222407.2 |
| 1583 | 225407.2 |
| 1584 | 229407.2 |
| 1585 | 227207.2 |
| 1586 | 232207.2 |
| 1587 | 235207.2 |
| 1588 | 231907.2 |
| 1589 | 228607.2 |
| 1590 | 224207.2 |
| 1591 | 218707.2 |
| 1592 | 223907.2 |
| 1593 | 227907.2 |
| 1594 | 228907.2 |
| 1595 | 231907.2 |
| 1596 | 234907.2 |
| 1597 | 237907.2 |
| 1598 | 240032.2 |
| 1599 | 236732.2 |
| 1600 | 231232.2 |
| 1601 | 228232.2 |
| 1602 | 231232.2 |
| 1603 | 236232.2 |
| 1604 | 240232.2 |
| 1605 | 236232.2 |
| 1606 | 240232.2 |
| 1607 | 235832.2 |
| 1608 | 238832.2 |
| 1609 | 234332.2 |
| 1610 | 233232.2 |
| 1611 | 237232.2 |
| 1612 | 240232.2 |
| 1613 | 245232.2 |
| 1614 | 249282.2 |
| 1615 | 243782.2 |
| 1616 | 247082.2 |
| 1617 | 243782.2 |
| 1618 | 247782.2 |
| 1619 | 243382.2 |
| 1620 | 240082.2 |
| 1621 | 240082.2 |
| 1622 | 243082.2 |
| 1623 | 240882.2 |
| 1624 | 241882.2 |
| 1625 | 244882.2 |
| 1626 | 247882.2 |
| 1627 | 247382.2 |
| 1628 | 249382.2 |
| 1629 | 243882.2 |
| 1630 | 239482.2 |
| 1631 | 236182.2 |
| 1632 | 233982.2 |
| 1633 | 229582.2 |
| 1634 | 224082.2 |
| 1635 | 228082.2 |
| 1636 | 225082.2 |
| 1637 | 220682.2 |
| 1638 | 224682.2 |
| 1639 | 226682.2 |
| 1640 | 230682.2 |
| 1641 | 234015.53 |
| 1642 | 230715.53 |
| 1643 | 228515.53 |
| 1644 | 223015.53 |
| 1645 | 224015.53 |
| 1646 | 218515.53 |
| 1647 | 214115.53 |
| 1648 | 210815.53 |
| 1649 | 206415.53 |
| 1650 | 203115.53 |
| 1651 | 206356.27 |
| 1652 | 207356.27 |
| 1653 | 211356.27 |
| 1654 | 206956.27 |
| 1655 | 204756.27 |
| 1656 | 200356.27 |
| 1657 | 194856.27 |
| 1658 | 199856.27 |
| 1659 | 203189.6 |
| 1660 | 206189.6 |
| 1661 | 210189.6 |
| 1662 | 207989.6 |
| 1663 | 204689.6 |
| 1664 | 200289.6 |
| 1665 | 194789.6 |
| 1666 | 193689.6 |
| 1667 | 188189.6 |
| 1668 | 191332.46 |
| 1669 | 198532.46 |
| 1670 | 201532.46 |
| 1671 | 202532.46 |
| 1672 | 203532.46 |
| 1673 | 199132.46 |
| 1674 | 202132.46 |
| 1675 | 198832.46 |
| 1676 | 202832.46 |
| 1677 | 197332.46 |
| 1678 | 195132.46 |
| 1679 | 199132.46 |
| 1680 | 193632.46 |
| 1681 | 190332.46 |
| 1682 | 188132.46 |
| 1683 | 186132.46 |
| 1684 | 189132.46 |
| 1685 | 185832.46 |
| 1686 | 184732.46 |
| 1687 | 186732.46 |
| 1688 | 188732.46 |
| 1689 | 193732.46 |
| 1690 | 196732.46 |
| 1691 | 200732.46 |
| 1692 | 203809.38 |
| 1693 | 207142.71 |
| 1694 | 201642.71 |
| 1695 | 197242.71 |
| 1696 | 198242.71 |
| 1697 | 201542.71 |
| 1698 | 203730.21 |
| 1699 | 208275.66 |
| 1700 | 207175.66 |
| 1701 | 211175.66 |
| 1702 | 214125.66 |
| 1703 | 210825.66 |
| 1704 | 207825.66 |
| 1705 | 210825.66 |
| 1706 | 208625.66 |
| 1707 | 204225.66 |
| 1708 | 208225.66 |
| 1709 | 207125.66 |
| 1710 | 201625.66 |
| 1711 | 204625.66 |
| 1712 | 209208.99 |
| 1713 | 205908.99 |
| 1714 | 208908.99 |
| 1715 | 203408.99 |
| 1716 | 202308.99 |
| 1717 | 206308.99 |
| 1718 | 203008.99 |
| 1719 | 197508.99 |
| 1720 | 200508.99 |
| 1721 | 203508.99 |
| 1722 | 206508.99 |
| 1723 | 205408.99 |
| 1724 | 209408.99 |
| 1725 | 207208.99 |
| 1726 | 210208.99 |
| 1727 | 214408.99 |
| 1728 | 215408.99 |
| 1729 | 218408.99 |
| 1730 | 215108.99 |
| 1731 | 220108.99 |
| 1732 | 223290.81 |
| 1733 | 224290.81 |
| 1734 | 228290.81 |
| 1735 | 232290.81 |
| 1736 | 228990.81 |
| 1737 | 224590.81 |
| 1738 | 222390.81 |
| 1739 | 224390.81 |
| 1740 | 229390.81 |
| 1741 | 232015.81 |
| 1742 | 234015.81 |
| 1743 | 239015.81 |
| 1744 | 234615.81 |
| 1745 | 237615.81 |
| 1746 | 240615.81 |
| 1747 | 240115.81 |
| 1748 | 244115.81 |
| 1749 | 245115.81 |
| 1750 | 250115.81 |
| 1751 | 253115.81 |
| 1752 | 256115.81 |
| 1753 | 252815.81 |
| 1754 | 251715.81 |
| 1755 | 256715.81 |
| 1756 | 259715.81 |
| 1757 | 264715.81 |
| 1758 | 267715.81 |
| 1759 | 263315.81 |
| 1760 | 258915.81 |
| 1761 | 254515.81 |
| 1762 | 257515.81 |
| 1763 | 261515.81 |
| 1764 | 262515.81 |
| 1765 | 258115.81 |
| 1766 | 262115.81 |
| 1767 | 265115.81 |
| 1768 | 269115.81 |
| 1769 | 272240.81 |
| 1770 | 275240.81 |
| 1771 | 270840.81 |
| 1772 | 275840.81 |
| 1773 | 277924.14 |
| 1774 | 282924.14 |
| 1775 | 283924.14 |
| 1776 | 279524.14 |
| 1777 | 283524.14 |
| 1778 | 279124.14 |
| 1779 | 281124.14 |
| 1780 | 278924.14 |
| 1781 | 282257.47 |
| 1782 | 277857.47 |
| 1783 | 272357.47 |
| 1784 | 274357.47 |
| 1785 | 275357.47 |
| 1786 | 272857.47 |
| 1787 | 267357.47 |
| 1788 | 270357.47 |
| 1789 | 275357.47 |
| 1790 | 270957.47 |
| 1791 | 275957.47 |
| 1792 | 272657.47 |
| 1793 | 269357.47 |
| 1794 | 269357.47 |
| 1795 | 273057.47 |
| 1796 | 278057.47 |
| 1797 | 272557.47 |
| 1798 | 269257.47 |
| 1799 | 263757.47 |
| 1800 | 267757.47 |
| 1801 | 269757.47 |
| 1802 | 268757.47 |
| 1803 | 270297.47 |
| 1804 | 271167.47 |
| 1805 | 268167.47 |
| 1806 | 264867.47 |
| 1807 | 261567.47 |
| 1808 | 260467.47 |
| 1809 | 254967.47 |
| 1810 | 258967.47 |
| 1811 | 259967.47 |
| 1812 | 262967.47 |
| 1813 | 258567.47 |
| 1814 | 262567.47 |
| 1815 | 265567.47 |
| 1816 | 262267.47 |
| 1817 | 258967.47 |
| 1818 | 261967.47 |
| 1819 | 259767.47 |
| 1820 | 260767.47 |
| 1821 | 257467.47 |
| 1822 | 256367.47 |
| 1823 | 261367.47 |
| 1824 | 256967.47 |
| 1825 | 254217.47 |
| 1826 | 257217.47 |
| 1827 | 260217.47 |
| 1828 | 262217.47 |
| 1829 | 267217.47 |
| 1830 | 266117.47 |
| 1831 | 263117.47 |
| 1832 | 260917.47 |
| 1833 | 264917.47 |
| 1834 | 266735.65 |
| 1835 | 271735.65 |
| 1836 | 274885.65 |
| 1837 | 273885.65 |
| 1838 | 275885.65 |
| 1839 | 281440.65 |
| 1840 | 284440.65 |
| 1841 | 283340.65 |
| 1842 | 280040.65 |
| 1843 | 283040.65 |
| 1844 | 280840.65 |
| 1845 | 277540.65 |
| 1846 | 274240.65 |
| 1847 | 276513.38 |
| 1848 | 281513.38 |
| 1849 | 278513.38 |
| 1850 | 281240.65 |
| 1851 | 283513.38 |
| 1852 | 287513.38 |
| 1853 | 290513.38 |
| 1854 | 287213.38 |
| 1855 | 282713.38 |
| 1856 | 284813.38 |
| 1857 | 287313.38 |
| 1858 | 286313.38 |
| 1859 | 283013.38 |
| 1860 | 281013.38 |
| 1861 | 277713.38 |
| 1862 | 280713.38 |
| 1863 | 282713.38 |
| 1864 | 277213.38 |
| 1865 | 271713.38 |
| 1866 | 273452.51 |
| 1867 | 270152.51 |
| 1868 | 266652.51 |
| 1869 | 264452.51 |
| 1870 | 267495.99 |
| 1871 | 267495.99 |
| 1872 | 270495.99 |
| 1873 | 264995.99 |
| 1874 | 267995.99 |
| 1875 | 271995.99 |
| 1876 | 269795.99 |
| 1877 | 272938.85 |
| 1878 | 276688.85 |
| 1879 | 275588.85 |
| 1880 | 278588.85 |
| 1881 | 281588.85 |
| 1882 | 277188.85 |
| 1883 | 281188.85 |
| 1884 | 281188.85 |
| 1885 | 286188.85 |
| 1886 | 282888.85 |
| 1887 | 285888.85 |
| 1888 | 287888.85 |
| 1889 | 290888.85 |
| 1890 | 292888.85 |
| 1891 | 291788.85 |
| 1892 | 293788.85 |
| 1893 | 292788.85 |
| 1894 | 287288.85 |
| 1895 | 289288.85 |
| 1896 | 292438.85 |
| 1897 | 289138.85 |
| 1898 | 293138.85 |
| 1899 | 289138.85 |
| 1900 | 288138.85 |
| 1901 | 285938.85 |
| 1902 | 282638.85 |
| 1903 | 277138.85 |
| 1904 | 272738.85 |
| 1905 | 275738.85 |
| 1906 | 273538.85 |
| 1907 | 276538.85 |
| 1908 | 275438.85 |
| 1909 | 272138.85 |
| 1910 | 266638.85 |
| 1911 | 269972.18 |
| 1912 | 268972.18 |
| 1913 | 264572.18 |
| 1914 | 260172.18 |
| 1915 | 259072.18 |
| 1916 | 256872.18 |
| 1917 | 253572.18 |
| 1918 | 248072.18 |
| 1919 | 251072.18 |
| 1920 | 256072.18 |
| 1921 | 250572.18 |
| 1922 | 255572.18 |
| 1923 | 253072.18 |
| 1924 | 249772.18 |
| 1925 | 254772.18 |
| 1926 | 251472.18 |
| 1927 | 248172.18 |
| 1928 | 244872.18 |
| 1929 | 242672.18 |
| 1930 | 244672.18 |
| 1931 | 249672.18 |
| 1932 | 253672.18 |
| 1933 | 250372.18 |
| 1934 | 244872.18 |
| 1935 | 245872.18 |
| 1936 | 249872.18 |
| 1937 | 252872.18 |
| 1938 | 249572.18 |
| 1939 | 252572.18 |
| 1940 | 255488.85 |
| 1941 | 255488.85 |
| 1942 | 260488.85 |
| 1943 | 263488.85 |
| 1944 | 265488.85 |
| 1945 | 267888.85 |
| 1946 | 263488.85 |
| 1947 | 267488.85 |
| 1948 | 267488.85 |
| 1949 | 261988.85 |
| 1950 | 266988.85 |
| 1951 | 270988.85 |
| 1952 | 267688.85 |
| 1953 | 262188.85 |
| 1954 | 263188.85 |
| 1955 | 268188.85 |
| 1956 | 271188.85 |
| 1957 | 267888.85 |
| 1958 | 271888.85 |
| 1959 | 275888.85 |
| 1960 | 278888.85 |
| 1961 | 280888.85 |
| 1962 | 283888.85 |
| 1963 | 278388.85 |
| 1964 | 277288.85 |
| 1965 | 273988.85 |
| 1966 | 270688.85 |
| 1967 | 266688.85 |
| 1968 | 267688.85 |
| 1969 | 270688.85 |
| 1970 | 275688.85 |
| 1971 | 279688.85 |
| 1972 | 282688.85 |
| 1973 | 283688.85 |
| 1974 | 279288.85 |
| 1975 | 275988.85 |
| 1976 | 279988.85 |
| 1977 | 282188.85 |
| 1978 | 283188.85 |
| 1979 | 280188.85 |
| 1980 | 276888.85 |
| 1981 | 271388.85 |
| 1982 | 268088.85 |
| 1983 | 265888.85 |
| 1984 | 268888.85 |
| 1985 | 265588.85 |
| 1986 | 262288.85 |
| 1987 | 263288.85 |
| 1988 | 265288.85 |
| 1989 | 268288.85 |
| 1990 | 272288.85 |
| 1991 | 266788.85 |
| 1992 | 264588.85 |
| 1993 | 266588.85 |
| 1994 | 263288.85 |
| 1995 | 257788.85 |
| 1996 | 260788.85 |
| 1997 | 257788.85 |
| 1998 | 254488.85 |
| 1999 | 257488.85 |
| 2000 | 254188.85 |
| 2001 | 250888.85 |
| 2002 | 247588.85 |
| 2003 | 242088.85 |
| 2004 | 242088.85 |
| 2005 | 236588.85 |
| 2006 | 237588.85 |
| 2007 | 242588.85 |
| 2008 | 238588.85 |
| 2009 | 234188.85 |
| 2010 | 231188.85 |
| 2011 | 227888.85 |
| 2012 | 225688.85 |
| 2013 | 228605.52 |
| 2014 | 225305.52 |
| 2015 | 229305.52 |
| 2016 | 223805.52 |
| 2017 | 219405.52 |
| 2018 | 221405.52 |
| 2019 | 220405.52 |
| 2020 | 223405.52 |
| 2021 | 221205.52 |
| 2022 | 217905.52 |
| 2023 | 221905.52 |
| 2024 | 226905.52 |
| 2025 | 223605.52 |
| 2026 | 222505.52 |
| 2027 | 224505.52 |
| 2028 | 221205.52 |
| 2029 | 221205.52 |
| 2030 | 226205.52 |
| 2031 | 228205.52 |
| 2032 | 228205.52 |
| 2033 | 228205.52 |
| 2034 | 233205.52 |
| 2035 | 229905.52 |
| 2036 | 233905.52 |
| 2037 | 234905.52 |
| 2038 | 239905.52 |
| 2039 | 235505.52 |
| 2040 | 238505.52 |
| 2041 | 243505.52 |
| 2042 | 248785.52 |
| 2043 | 253785.52 |
| 2044 | 256512.79 |
| 2045 | 259112.79 |
| 2046 | 255812.79 |
| 2047 | 252512.79 |
| 2048 | 255694.61 |
| 2049 | 260694.61 |
| 2050 | 258494.61 |
| 2051 | 257394.61 |
| 2052 | 254094.61 |
| 2053 | 251894.61 |
| 2054 | 247494.61 |
| 2055 | 241994.61 |
| 2056 | 244994.61 |
| 2057 | 238494.61 |
| 2058 | 243494.61 |
| 2059 | 240194.61 |
| 2060 | 234794.61 |
| 2061 | 238794.61 |
| 2062 | 239794.61 |
| 2063 | 237594.61 |
| 2064 | 234294.61 |
| 2065 | 234294.61 |
| 2066 | 239294.61 |
| 2067 | 242294.61 |
| 2068 | 238994.61 |
| 2069 | 241994.61 |
| 2070 | 244994.61 |
| 2071 | 240994.61 |
| 2072 | 235494.61 |
| 2073 | 238494.61 |
| 2074 | 243494.61 |
| 2075 | 248494.61 |
| 2076 | 252494.61 |
| 2077 | 257494.61 |
| 2078 | 260411.28 |
| 2079 | 261411.28 |
| 2080 | 266411.28 |
| 2081 | 268381.28 |
| 2082 | 264881.28 |
| 2083 | 266881.28 |
| 2084 | 268881.28 |
| 2085 | 269881.28 |
| 2086 | 267681.28 |
| 2087 | 268681.28 |
| 2088 | 272681.28 |
| 2089 | 267181.28 |
| 2090 | 267181.28 |
| 2091 | 270181.28 |
| 2092 | 274181.28 |
| 2093 | 277181.28 |
| 2094 | 280181.28 |
| 2095 | 282181.28 |
| 2096 | 277781.28 |
| 2097 | 276681.28 |
| 2098 | 276181.28 |
| 2099 | 281181.28 |
| 2100 | 277881.28 |
| 2101 | 274581.28 |
| 2102 | 278581.28 |
| 2103 | 280581.28 |
| 2104 | 278381.28 |
| 2105 | 273981.28 |
| 2106 | 278981.28 |
| 2107 | 275681.28 |
| 2108 | 274681.28 |
| 2109 | 276681.28 |
| 2110 | 274481.28 |
| 2111 | 271181.28 |
| 2112 | 267881.28 |
| 2113 | 265681.28 |
| 2114 | 266681.28 |
| 2115 | 263381.28 |
| 2116 | 258981.28 |
| 2117 | 262981.28 |
| 2118 | 259681.28 |
| 2119 | 261681.28 |
| 2120 | 266681.28 |
| 2121 | 263681.28 |
| 2122 | 265681.28 |
| 2123 | 270681.28 |
| 2124 | 272954.28 |
| 2125 | 275954.28 |
| 2126 | 272654.28 |
| 2127 | 269354.28 |
| 2128 | 267154.28 |
| 2129 | 268154.28 |
| 2130 | 262654.28 |
| 2131 | 266654.28 |
| 2132 | 264454.28 |
| 2133 | 268454.28 |
| 2134 | 266254.28 |
| 2135 | 269254.28 |
| 2136 | 268254.28 |
| 2137 | 262754.28 |
| 2138 | 258354.28 |
| 2139 | 261354.28 |
| 2140 | 262354.28 |
| 2141 | 260154.28 |
| 2142 | 261154.28 |
| 2143 | 258154.28 |
| 2144 | 263154.28 |
| 2145 | 260954.28 |
| 2146 | 256554.28 |
| 2147 | 252154.28 |
| 2148 | 255154.28 |
| 2149 | 251854.28 |
| 2150 | 247454.28 |
| 2151 | 241954.28 |
| 2152 | 244954.28 |
| 2153 | 246954.28 |
| 2154 | 250704.28 |
| 2155 | 251704.28 |
| 2156 | 249504.28 |
| 2157 | 245104.28 |
| 2158 | 240704.28 |
| 2159 | 245704.28 |
| 2160 | 241304.28 |
| 2161 | 244304.28 |
| 2162 | 242104.28 |
| 2163 | 239904.28 |
| 2164 | 234404.28 |
| 2165 | 239404.28 |
| 2166 | 236104.28 |
| 2167 | 233904.28 |
| 2168 | 230604.28 |
| 2169 | 233604.28 |
| 2170 | 234604.28 |
| 2171 | 239604.28 |
| 2172 | 237404.28 |
| 2173 | 240404.28 |
| 2174 | 243404.28 |
| 2175 | 248404.28 |
| 2176 | 245104.28 |
| 2177 | 248104.28 |
| 2178 | 251104.28 |
| 2179 | 248604.28 |
| 2180 | 243104.28 |
| 2181 | 247004.28 |
| 2182 | 251004.28 |
| 2183 | 253079.28 |
| 2184 | 254079.28 |
| 2185 | 251879.28 |
| 2186 | 254879.28 |
| 2187 | 253879.28 |
| 2188 | 256879.28 |
| 2189 | 263754.28 |
| 2190 | 266754.28 |
| 2191 | 268754.28 |
| 2192 | 270754.28 |
| 2193 | 267454.28 |
| 2194 | 268454.28 |
| 2195 | 265154.28 |
| 2196 | 259654.28 |
| 2197 | 255254.28 |
| 2198 | 259129.28 |
| 2199 | 262129.28 |
| 2200 | 259929.28 |
| 2201 | 256629.28 |
| 2202 | 254429.28 |
| 2203 | 254179.28 |
| 2204 | 259954.28 |
| 2205 | 257454.28 |
| 2206 | 254954.28 |
| 2207 | 256693.28 |
| 2208 | 258693.28 |
| 2209 | 253193.28 |
| 2210 | 248793.28 |
| 2211 | 245793.28 |
| 2212 | 242493.28 |
| 2213 | 240293.28 |
| 2214 | 244293.28 |
| 2215 | 241293.28 |
| 2216 | 242341.28 |
| 2217 | 240341.28 |
| 2218 | 238141.28 |
| 2219 | 237141.28 |
| 2220 | 233841.28 |
| 2221 | 233841.28 |
| 2222 | 236841.28 |
| 2223 | 231341.28 |
| 2224 | 235341.28 |
| 2225 | 237341.28 |
| 2226 | 243941.28 |
| 2227 | 240941.28 |
| 2228 | 238741.28 |
| 2229 | 241741.28 |
| 2230 | 244741.28 |
| 2231 | 243641.28 |
| 2232 | 238141.28 |
| 2233 | 241141.28 |
| 2234 | 236741.28 |
| 2235 | 238741.28 |
| 2236 | 245141.28 |
| 2237 | 243641.28 |
| 2238 | 240341.28 |
| 2239 | 234841.28 |
| 2240 | 236841.28 |
| 2241 | 234841.28 |
| 2242 | 232641.28 |
| 2243 | 228241.28 |
| 2244 | 223841.28 |
| 2245 | 220541.28 |
| 2246 | 215541.28 |
| 2247 | 212241.28 |
| 2248 | 211241.28 |
| 2249 | 213241.28 |
| 2250 | 215241.28 |
| 2251 | 219241.28 |
| 2252 | 222241.28 |
| 2253 | 225891.28 |
| 2254 | 222591.28 |
| 2255 | 223841.28 |
| 2256 | 228841.28 |
| 2257 | 224441.28 |
| 2258 | 226441.28 |
| 2259 | 230991.28 |
| 2260 | 229891.28 |
| 2261 | 232891.28 |
| 2262 | 237239.28 |
| 2263 | 240239.28 |
| 2264 | 236939.28 |
| 2265 | 234939.28 |
| 2266 | 236939.28 |
| 2267 | 241939.28 |
| 2268 | 254314.28 |
| 2269 | 251814.28 |
| 2270 | 259514.28 |
| 2271 | 261514.28 |
| 2272 | 258514.28 |
| 2273 | 262514.28 |
| 2274 | 260314.28 |
| 2275 | 258114.28 |
| 2276 | 264714.28 |
| 2277 | 262714.28 |
| 2278 | 264714.28 |
| 2279 | 269714.28 |
| 2280 | 267514.28 |
| 2281 | 270514.28 |
| 2282 | 273514.28 |
| 2283 | 271314.28 |
| 2284 | 269114.28 |
| 2285 | 273114.28 |
| 2286 | 269814.28 |
| 2287 | 267314.28 |
| 2288 | 270314.28 |
| 2289 | 275314.28 |
| 2290 | 280314.28 |
| 2291 | 278114.28 |
| 2292 | 274814.28 |
| 2293 | 279814.28 |
| 2294 | 288564.28 |
| 2295 | 293564.28 |
| 2296 | 290264.28 |
| 2297 | 288064.28 |
| 2298 | 293064.28 |
| 2299 | 288664.28 |
| 2300 | 291664.28 |
| 2301 | 294664.28 |
| 2302 | 292664.28 |
| 2303 | 297664.28 |
| 2304 | 304814.28 |
| 2305 | 306814.28 |
| 2306 | 304814.28 |
| 2307 | 307214.28 |
| 2308 | 310214.28 |
| 2309 | 308214.28 |
| 2310 | 313214.28 |
| 2311 | 313214.28 |
| 2312 | 316214.28 |
| 2313 | 310714.28 |
| 2314 | 313714.28 |
| 2315 | 308214.28 |
| 2316 | 313214.28 |
| 2317 | 311014.28 |
| 2318 | 316014.28 |
| 2319 | 312714.28 |
| 2320 | 322339.28 |
| 2321 | 320139.28 |
| 2322 | 314639.28 |
| 2323 | 316639.28 |
| 2324 | 321877.28 |
| 2325 | 317877.28 |
| 2326 | 314577.28 |
| 2327 | 312377.28 |
| 2328 | 310177.28 |
| 2329 | 313177.28 |
| 2330 | 307677.28 |
| 2331 | 309677.28 |
| 2332 | 312677.28 |
| 2333 | 316677.28 |
| 2334 | 317677.28 |
| 2335 | 320677.28 |
| 2336 | 322677.28 |
| 2337 | 323677.28 |
| 2338 | 319277.28 |
| 2339 | 317077.28 |
| 2340 | 313777.28 |
| 2341 | 315777.28 |
| 2342 | 320777.28 |
| 2343 | 318277.28 |
| 2344 | 321277.28 |
| 2345 | 319077.28 |
| 2346 | 313577.28 |
| 2347 | 311377.28 |
| 2348 | 308077.28 |
| 2349 | 304777.28 |
| 2350 | 306777.28 |
| 2351 | 301277.28 |
| 2352 | 303277.28 |
| 2353 | 298877.28 |
| 2354 | 304502.28 |
| 2355 | 302302.28 |
| 2356 | 304302.28 |
| 2357 | 305302.28 |
| 2358 | 310302.28 |
| 2359 | 307002.28 |
| 2360 | 309002.28 |
| 2361 | 305702.28 |
| 2362 | 303502.28 |
| 2363 | 306502.28 |
| 2364 | 310348.28 |
| 2365 | 308148.28 |
| 2366 | 313648.28 |
| 2367 | 316648.28 |
| 2368 | 313348.28 |
| 2369 | 314348.28 |
| 2370 | 309948.28 |
| 2371 | 307448.28 |
| 2372 | 310448.28 |
| 2373 | 315448.28 |
| 2374 | 318448.28 |
| 2375 | 322648.28 |
| 2376 | 320448.28 |
| 2377 | 317148.28 |
| 2378 | 314148.28 |
| 2379 | 309748.28 |
| 2380 | 314748.28 |
| 2381 | 313648.28 |
| 2382 | 317648.28 |
| 2383 | 320648.28 |
| 2384 | 322648.28 |
| 2385 | 319148.28 |
| 2386 | 316948.28 |
| 2387 | 318948.28 |
| 2388 | 321556.98 |
| 2389 | 316056.98 |
| 2390 | 313056.98 |
| 2391 | 316056.98 |
| 2392 | 312756.98 |
| 2393 | 311656.98 |
| 2394 | 309656.98 |
| 2395 | 311656.98 |
| 2396 | 314656.98 |
| 2397 | 312456.98 |
| 2398 | 316456.98 |
| 2399 | 314256.98 |
| 2400 | 312056.98 |
| 2401 | 306556.98 |
| 2402 | 303256.98 |
| 2403 | 306256.98 |
| 2404 | 310839.98 |
| 2405 | 313839.98 |
| 2406 | 317172.98 |
| 2407 | 320172.98 |
| 2408 | 316872.98 |
| 2409 | 313572.98 |
| 2410 | 308072.98 |
| 2411 | 311072.98 |
| 2412 | 307772.98 |
| 2413 | 306672.98 |
| 2414 | 301172.98 |
| 2415 | 304172.98 |
| 2416 | 307172.98 |
| 2417 | 302772.98 |
| 2418 | 304772.98 |
| 2419 | 307153.93 |
| 2420 | 308153.93 |
| 2421 | 312153.93 |
| 2422 | 314153.93 |
| 2423 | 311653.93 |
| 2424 | 314153.93 |
| 2425 | 308653.93 |
| 2426 | 313653.93 |
| 2427 | 309353.93 |
| 2428 | 307153.93 |
| 2429 | 304953.93 |
| 2430 | 301653.93 |
| 2431 | 298353.93 |
| 2432 | 300353.93 |
| 2433 | 298353.93 |
| 2434 | 299353.93 |
| 2435 | 296053.93 |
| 2436 | 291653.93 |
| 2437 | 294653.93 |
| 2438 | 294653.93 |
| 2439 | 291353.93 |
| 2440 | 289153.93 |
| 2441 | 283653.93 |
| 2442 | 278153.93 |
| 2443 | 281153.93 |
| 2444 | 282153.93 |
| 2445 | 279153.93 |
| 2446 | 274853.93 |
| 2447 | 279044.41 |
| 2448 | 280794.41 |
| 2449 | 286569.41 |
| 2450 | 282169.41 |
| 2451 | 279169.41 |
| 2452 | 275869.41 |
| 2453 | 270369.41 |
| 2454 | 273238.41 |
| 2455 | 269938.41 |
| 2456 | 266938.41 |
| 2457 | 264738.41 |
| 2458 | 266738.41 |
| 2459 | 265638.41 |
| 2460 | 262338.41 |
| 2461 | 261238.41 |
| 2462 | 263238.41 |
| 2463 | 266838.41 |
| 2464 | 261338.41 |
| 2465 | 267238.41 |
| 2466 | 265038.41 |
| 2467 | 261738.41 |
| 2468 | 265738.41 |
| 2469 | 263538.41 |
| 2470 | 258038.41 |
| 2471 | 254738.41 |
| 2472 | 252738.41 |
| 2473 | 254738.41 |
| 2474 | 252238.41 |
| 2475 | 247938.41 |
| 2476 | 243538.41 |
| 2477 | 246538.41 |
| 2478 | 249538.41 |
| 2479 | 252538.41 |
| 2480 | 260038.41 |
| 2481 | 261288.41 |
| 2482 | 259288.41 |
| 2483 | 262288.41 |
| 2484 | 257888.41 |
| 2485 | 260888.41 |
| 2486 | 255388.41 |
| 2487 | 250988.41 |
| 2488 | 247988.41 |
| 2489 | 244688.41 |
| 2490 | 243588.41 |
| 2491 | 240288.41 |
| 2492 | 238088.41 |
| 2493 | 241088.41 |
| 2494 | 238888.41 |
| 2495 | 243508.41 |
| 2496 | 247417.41 |
| 2497 | 250417.41 |
| 2498 | 246017.41 |
| 2499 | 242717.41 |
| 2500 | 239417.41 |
| 2501 | 243417.41 |
| 2502 | 244417.41 |
| 2503 | 239917.41 |
| 2504 | 237917.41 |
| 2505 | 239917.41 |
| 2506 | 243917.41 |
| 2507 | 246917.41 |
| 2508 | 248917.41 |
| 2509 | 246917.41 |
| 2510 | 250667.41 |
| 2511 | 253667.41 |
| 2512 | 255667.41 |
| 2513 | 260667.41 |
| 2514 | 264303.77 |
| 2515 | 271728.77 |
| 2516 | 273728.77 |
| 2517 | 270428.77 |
| 2518 | 274478.77 |
| 2519 | 280253.77 |
| 2520 | 278253.77 |
| 2521 | 274953.77 |
| 2522 | 277953.77 |
| 2523 | 282953.77 |
| 2524 | 287453.77 |
| 2525 | 281953.77 |
| 2526 | 283953.77 |
| 2527 | 280653.77 |
| 2528 | 277353.77 |
| 2529 | 272953.77 |
| 2530 | 268953.77 |
| 2531 | 263453.77 |
| 2532 | 260453.77 |
| 2533 | 257153.77 |
| 2534 | 254953.77 |
| 2535 | 252953.77 |
| 2536 | 255953.77 |
| 2537 | 260953.77 |
| 2538 | 257653.77 |
| 2539 | 254353.77 |
| 2540 | 257353.77 |
| 2541 | 259353.77 |
| 2542 | 260353.77 |
| 2543 | 258153.77 |
| 2544 | 265963.77 |
| 2545 | 269863.77 |
| 2546 | 265463.77 |
| 2547 | 268463.77 |
| 2548 | 264963.77 |
| 2549 | 269963.77 |
| 2550 | 269963.77 |
| 2551 | 266663.77 |
| 2552 | 263363.77 |
| 2553 | 269963.77 |
| 2554 | 266963.77 |
| 2555 | 264763.77 |
| 2556 | 261463.77 |
| 2557 | 258463.77 |
| 2558 | 252963.77 |
| 2559 | 254963.77 |
| 2560 | 251663.77 |
| 2561 | 253838.77 |
| 2562 | 248338.77 |
| 2563 | 252338.77 |
| 2564 | 257338.77 |
| 2565 | 255138.77 |
| 2566 | 252938.77 |
| 2567 | 255938.77 |
| 2568 | 260938.77 |
| 2569 | 265938.77 |
| 2570 | 267938.77 |
| 2571 | 271938.77 |
| 2572 | 271938.77 |
| 2573 | 274938.77 |
| 2574 | 280176.87 |
| 2575 | 274676.87 |
| 2576 | 272176.87 |
| 2577 | 271076.87 |
| 2578 | 273076.87 |
| 2579 | 273076.87 |
| 2580 | 275076.87 |
| 2581 | 272876.87 |
| 2582 | 273876.87 |
| 2583 | 270576.87 |
| 2584 | 265076.87 |
| 2585 | 267076.87 |
| 2586 | 265076.87 |
| 2587 | 265076.87 |
| 2588 | 261776.87 |
| 2589 | 258476.87 |
| 2590 | 256276.87 |
| 2591 | 260276.87 |
| 2592 | 258076.87 |
| 2593 | 253676.87 |
| 2594 | 251476.87 |
| 2595 | 248176.87 |
| 2596 | 245976.87 |
| 2597 | 247976.87 |
| 2598 | 248976.87 |
| 2599 | 255631.87 |
| 2600 | 258631.87 |
| 2601 | 260941.87 |
| 2602 | 258741.87 |
| 2603 | 256541.87 |
| 2604 | 259541.87 |
| 2605 | 257341.87 |
| 2606 | 259341.87 |
| 2607 | 256041.87 |
| 2608 | 257041.87 |
| 2609 | 259041.87 |
| 2610 | 262041.87 |
| 2611 | 257641.87 |
| 2612 | 253241.87 |
| 2613 | 249941.87 |
| 2614 | 254941.87 |
| 2615 | 257941.87 |
| 2616 | 261941.87 |
| 2617 | 258641.87 |
| 2618 | 258641.87 |
| 2619 | 264091.87 |
| 2620 | 267091.87 |
| 2621 | 264891.87 |
| 2622 | 265891.87 |
| 2623 | 263691.87 |
| 2624 | 265691.87 |
| 2625 | 263491.87 |
| 2626 | 267491.87 |
| 2627 | 270535.35 |
| 2628 | 268335.35 |
| 2629 | 265035.35 |
| 2630 | 267035.35 |
| 2631 | 274460.35 |
| 2632 | 272260.35 |
| 2633 | 268960.35 |
| 2634 | 271960.35 |
| 2635 | 275960.35 |
| 2636 | 278569.05 |
| 2637 | 280569.05 |
| 2638 | 277269.05 |
| 2639 | 275069.05 |
| 2640 | 277069.05 |
| 2641 | 274869.05 |
| 2642 | 275869.05 |
| 2643 | 272569.05 |
| 2644 | 270569.05 |
| 2645 | 267269.05 |
| 2646 | 262869.05 |
| 2647 | 257369.05 |
| 2648 | 258369.05 |
| 2649 | 261369.05 |
| 2650 | 255869.05 |
| 2651 | 257869.05 |
| 2652 | 261869.05 |
| 2653 | 259669.05 |
| 2654 | 258569.05 |
| 2655 | 262482.09 |
| 2656 | 266482.09 |
| 2657 | 269170.09 |
| 2658 | 271170.09 |
| 2659 | 267870.09 |
| 2660 | 267870.09 |
| 2661 | 264570.09 |
| 2662 | 261570.09 |
| 2663 | 266570.09 |
| 2664 | 269195.09 |
| 2665 | 268095.09 |
| 2666 | 270495.09 |
| 2667 | 267195.09 |
| 2668 | 269195.09 |
| 2669 | 271195.09 |
| 2670 | 266795.09 |
| 2671 | 268795.09 |
| 2672 | 267695.09 |
| 2673 | 272695.09 |
| 2674 | 275695.09 |
| 2675 | 279695.09 |
| 2676 | 276395.09 |
| 2677 | 271995.09 |
| 2678 | 277770.09 |
| 2679 | 279770.09 |
| 2680 | 282770.09 |
| 2681 | 280570.09 |
| 2682 | 283570.09 |
| 2683 | 285570.09 |
| 2684 | 282270.09 |
| 2685 | 280770.09 |
| 2686 | 277470.09 |
| 2687 | 275270.09 |
| 2688 | 276270.09 |
| 2689 | 270770.09 |
| 2690 | 273770.09 |
| 2691 | 276770.09 |
| 2692 | 279170.09 |
| 2693 | 274770.09 |
| 2694 | 272570.09 |
| 2695 | 267070.09 |
| 2696 | 262670.09 |
| 2697 | 260470.09 |
| 2698 | 262470.09 |
| 2699 | 258070.09 |
| 2700 | 261070.09 |
| 2701 | 259070.09 |
| 2702 | 254070.09 |
| 2703 | 256986.76 |
| 2704 | 260736.76 |
| 2705 | 263653.76 |
| 2706 | 266453.76 |
| 2707 | 264253.76 |
| 2708 | 260953.76 |
| 2709 | 255453.76 |
| 2710 | 258453.76 |
| 2711 | 255153.76 |
| 2712 | 258153.76 |
| 2713 | 254853.76 |
| 2714 | 256853.76 |
| 2715 | 254653.76 |
| 2716 | 249153.76 |
| 2717 | 246953.76 |
| 2718 | 244753.76 |
| 2719 | 244753.76 |
| 2720 | 249128.76 |
| 2721 | 252128.76 |
| 2722 | 248828.76 |
| 2723 | 245828.76 |
| 2724 | 243628.76 |
| 2725 | 246928.76 |
| 2726 | 241428.76 |
| 2727 | 240328.76 |
| 2728 | 242328.76 |
| 2729 | 245056.03 |
| 2730 | 249056.03 |
| 2731 | 245756.03 |
| 2732 | 246756.03 |
| 2733 | 249756.03 |
| 2734 | 254631.03 |
| 2735 | 251331.03 |
| 2736 | 253331.03 |
| 2737 | 256331.03 |
| 2738 | 259331.03 |
| 2739 | 258331.03 |
| 2740 | 261331.03 |
| 2741 | 259831.03 |
| 2742 | 254331.03 |
| 2743 | 252131.03 |
| 2744 | 255131.03 |
| 2745 | 258228.38 |
| 2746 | 256728.38 |
| 2747 | 261014.09 |
| 2748 | 256614.09 |
| 2749 | 253314.09 |
| 2750 | 257314.09 |
| 2751 | 252314.09 |
| 2752 | 249014.09 |
| 2753 | 245714.09 |
| 2754 | 246714.09 |
| 2755 | 244214.09 |
| 2756 | 247214.09 |
| 2757 | 250214.09 |
| 2758 | 246914.09 |
| 2759 | 249914.09 |
| 2760 | 250914.09 |
| 2761 | 252914.09 |
| 2762 | 249614.09 |
| 2763 | 244114.09 |
| 2764 | 239714.09 |
| 2765 | 242714.09 |
| 2766 | 241714.09 |
| 2767 | 245714.09 |
| 2768 | 248714.09 |
| 2769 | 251571.23 |
| 2770 | 254571.23 |
| 2771 | 254571.23 |
| 2772 | 257571.23 |
| 2773 | 259571.23 |
| 2774 | 254071.23 |
| 2775 | 250571.23 |
| 2776 | 249471.23 |
| 2777 | 256471.23 |
| 2778 | 258471.23 |
| 2779 | 262881.23 |
| 2780 | 260681.23 |
| 2781 | 266181.23 |
| 2782 | 268181.23 |
| 2783 | 271097.9 |
| 2784 | 273097.9 |
| 2785 | 277097.9 |
| 2786 | 280097.9 |
| 2787 | 275697.9 |
| 2788 | 278697.9 |
| 2789 | 281697.9 |
| 2790 | 279497.9 |
| 2791 | 281497.9 |
| 2792 | 287547.9 |
| 2793 | 284247.9 |
| 2794 | 281247.9 |
| 2795 | 278747.9 |
| 2796 | 274347.9 |
| 2797 | 273247.9 |
| 2798 | 267747.9 |
| 2799 | 267747.9 |
| 2800 | 272747.9 |
| 2801 | 273747.9 |
| 2802 | 276747.9 |
| 2803 | 279747.9 |
| 2804 | 282747.9 |
| 2805 | 285747.9 |
| 2806 | 288747.9 |
| 2807 | 292081.23 |
| 2808 | 286581.23 |
| 2809 | 289624.71 |
| 2810 | 286324.71 |
| 2811 | 287324.71 |
| 2812 | 292324.71 |
| 2813 | 296224.71 |
| 2814 | 299224.71 |
| 2815 | 293724.71 |
| 2816 | 291224.71 |
| 2817 | 286824.71 |
| 2818 | 283524.71 |
| 2819 | 291499.71 |
| 2820 | 292499.71 |
| 2821 | 296499.71 |
| 2822 | 296499.71 |
| 2823 | 301282.71 |
| 2824 | 305282.71 |
| 2825 | 301982.71 |
| 2826 | 300882.71 |
| 2827 | 303757.71 |
| 2828 | 300457.71 |
| 2829 | 300457.71 |
| 2830 | 300457.71 |
| 2831 | 297157.71 |
| 2832 | 301357.71 |
| 2833 | 305643.42 |
| 2834 | 303443.42 |
| 2835 | 297943.42 |
| 2836 | 295743.42 |
| 2837 | 298743.42 |
| 2838 | 300843.42 |
| 2839 | 299743.42 |
| 2840 | 296443.42 |
| 2841 | 293143.42 |
| 2842 | 287643.42 |
| 2843 | 285443.42 |
| 2844 | 293243.42 |
| 2845 | 294243.42 |
| 2846 | 292043.42 |
| 2847 | 292043.42 |
| 2848 | 295043.42 |
| 2849 | 300043.42 |
| 2850 | 298943.42 |
| 2851 | 301986.9 |
| 2852 | 304986.9 |
| 2853 | 309986.9 |
| 2854 | 312986.9 |
| 2855 | 315986.9 |
| 2856 | 313786.9 |
| 2857 | 310486.9 |
| 2858 | 314886.9 |
| 2859 | 318886.9 |
| 2860 | 316686.9 |
| 2861 | 321686.9 |
| 2862 | 324686.9 |
| 2863 | 327386.9 |
| 2864 | 324086.9 |
| 2865 | 319686.9 |
| 2866 | 324686.9 |
| 2867 | 319186.9 |
| 2868 | 322186.9 |
| 2869 | 318886.9 |
| 2870 | 322086.9 |
| 2871 | 325049.86 |
| 2872 | 330049.86 |
| 2873 | 328249.86 |
| 2874 | 327249.86 |
| 2875 | 330249.86 |
| 2876 | 325849.86 |
| 2877 | 323649.86 |
| 2878 | 326649.86 |
| 2879 | 328649.86 |
| 2880 | 326449.86 |
| 2881 | 323149.86 |
| 2882 | 322049.86 |
| 2883 | 318749.86 |
| 2884 | 314349.86 |
| 2885 | 312149.86 |
| 2886 | 308849.86 |
| 2887 | 310849.86 |
| 2888 | 312849.86 |
| 2889 | 314849.86 |
| 2890 | 312649.86 |
| 2891 | 310449.86 |
| 2892 | 311449.86 |
| 2893 | 313449.86 |
| 2894 | 309049.86 |
| 2895 | 305749.86 |
| 2896 | 305749.86 |
| 2897 | 304649.86 |
| 2898 | 302449.86 |
| 2899 | 298049.86 |
| 2900 | 301049.86 |
| 2901 | 304049.86 |
| 2902 | 300749.86 |
| 2903 | 302749.86 |
| 2904 | 304749.86 |
| 2905 | 307749.86 |
| 2906 | 310749.86 |
| 2907 | 305749.86 |
| 2908 | 304649.86 |
| 2909 | 306649.86 |
| 2910 | 303349.86 |
| 2911 | 308349.86 |
| 2912 | 310349.86 |
| 2913 | 314349.86 |
| 2914 | 316749.86 |
| 2915 | 314549.86 |
| 2916 | 310549.86 |
| 2917 | 308349.86 |
| 2918 | 305049.86 |
| 2919 | 306049.86 |
| 2920 | 310049.86 |
| 2921 | 312049.86 |
| 2922 | 316049.86 |
| 2923 | 314049.86 |
| 2924 | 317049.86 |
| 2925 | 318049.86 |
| 2926 | 320049.86 |
| 2927 | 316749.86 |
| 2928 | 321749.86 |
| 2929 | 324749.86 |
| 2930 | 326749.86 |
| 2931 | 324549.86 |
| 2932 | 327549.86 |
| 2933 | 330158.56 |
| 2934 | 333158.56 |
| 2935 | 332058.56 |
| 2936 | 335058.56 |
| 2937 | 337058.56 |
| 2938 | 341058.56 |
| 2939 | 337758.56 |
| 2940 | 333958.56 |
| 2941 | 335958.56 |
| 2942 | 332658.56 |
| 2943 | 337658.56 |
| 2944 | 334358.56 |
| 2945 | 337608.56 |
| 2946 | 339608.56 |
| 2947 | 337408.56 |
| 2948 | 340408.56 |
| 2949 | 342075.23 |
| 2950 | 339875.23 |
| 2951 | 336125.23 |
| 2952 | 338125.23 |
| 2953 | 337025.23 |
| 2954 | 340025.23 |
| 2955 | 345025.23 |
| 2956 | 350025.23 |
| 2957 | 347825.23 |
| 2958 | 344225.23 |
| 2959 | 346225.23 |
| 2960 | 349225.23 |
| 2961 | 347025.23 |
| 2962 | 349247.45 |
| 2963 | 352247.45 |
| 2964 | 354247.45 |
| 2965 | 352047.45 |
| 2966 | 351047.45 |
| 2967 | 352047.45 |
| 2968 | 346547.45 |
| 2969 | 350547.45 |
| 2970 | 352547.45 |
| 2971 | 349247.45 |
| 2972 | 348247.45 |
| 2973 | 351247.45 |
| 2974 | 352247.45 |
| 2975 | 354247.45 |
| 2976 | 349847.45 |
| 2977 | 354430.45 |
| 2978 | 351430.45 |
| 2979 | 348130.45 |
| 2980 | 345930.45 |
| 2981 | 348930.45 |
| 2982 | 346730.45 |
| 2983 | 345630.45 |
| 2984 | 347630.45 |
| 2985 | 344330.45 |
| 2986 | 339930.45 |
| 2987 | 342539.15 |
| 2988 | 347539.15 |
| 2989 | 345339.15 |
| 2990 | 342039.15 |
| 2991 | 345142.6 |
| 2992 | 348142.6 |
| 2993 | 347042.6 |
| 2994 | 343742.6 |
| 2995 | 339342.6 |
| 2996 | 337142.6 |
| 2997 | 336142.6 |
| 2998 | 332842.6 |
| 2999 | 327342.6 |
| 3000 | 324042.6 |
| 3001 | 326042.6 |
| 3002 | 325042.6 |
| 3003 | 322042.6 |
| 3004 | 324042.6 |
| 3005 | 320742.6 |
| 3006 | 322742.6 |
| 3007 | 324964.6 |
| 3008 | 323864.6 |
| 3009 | 326864.6 |
| 3010 | 321364.6 |
| 3011 | 323364.6 |
| 3012 | 318964.6 |
| 3013 | 317964.6 |
| 3014 | 314664.6 |
| 3015 | 309164.6 |
| 3016 | 311164.6 |
| 3017 | 307864.6 |
| 3018 | 308864.6 |
| 3019 | 313214.6 |
| 3020 | 311014.6 |
| 3021 | 313014.6 |
| 3022 | 310814.6 |
| 3023 | 313814.6 |
| 3024 | 319314.6 |
| 3025 | 317114.6 |
| 3026 | 313814.6 |
| 3027 | 312814.6 |
| 3028 | 310614.6 |
| 3029 | 306214.6 |
| 3030 | 308214.6 |
| 3031 | 303814.6 |
| 3032 | 308814.6 |
| 3033 | 305514.6 |
| 3034 | 308514.6 |
| 3035 | 313514.6 |
| 3036 | 312414.6 |
| 3037 | 309114.6 |
| 3038 | 306114.6 |
| 3039 | 308114.6 |
| 3040 | 310114.6 |
| 3041 | 312723.3 |
| 3042 | 315723.3 |
| 3043 | 312723.3 |
| 3044 | 310523.3 |
| 3045 | 312523.3 |
| 3046 | 313523.3 |
| 3047 | 310223.3 |
| 3048 | 311923.3 |
| 3049 | 313741.3 |
| 3050 | 315810.27 |
| 3051 | 317810.27 |
| 3052 | 321810.27 |
| 3053 | 325884.27 |
| 3054 | 322584.27 |
| 3055 | 321484.27 |
| 3056 | 318984.27 |
| 3057 | 316784.27 |
| 3058 | 318784.27 |
| 3059 | 316584.27 |
| 3060 | 313584.27 |
| 3061 | 315584.27 |
| 3062 | 313384.27 |
| 3063 | 311184.27 |
| 3064 | 308984.27 |
| 3065 | 311984.27 |
| 3066 | 314984.27 |
| 3067 | 313884.27 |
| 3068 | 310584.27 |
| 3069 | 307584.27 |
| 3070 | 307584.27 |
| 3071 | 302084.27 |
| 3072 | 306209.27 |
| 3073 | 308209.27 |
| 3074 | 310209.27 |
| 3075 | 313252.27 |
| 3076 | 309952.27 |
| 3077 | 310952.27 |
| 3078 | 307652.27 |
| 3079 | 302152.27 |
| 3080 | 298652.27 |
| 3081 | 300652.27 |
| 3082 | 302652.27 |
| 3083 | 301552.27 |
| 3084 | 300452.27 |
| 3085 | 303452.27 |
| 3086 | 302352.27 |
| 3087 | 305352.27 |
| 3088 | 302352.27 |
| 3089 | 306018.94 |
| 3090 | 303818.94 |
| 3091 | 306818.94 |
| 3092 | 309818.94 |
| 3093 | 306818.94 |
| 3094 | 307818.94 |
| 3095 | 309818.94 |
| 3096 | 314818.94 |
| 3097 | 312618.94 |
| 3098 | 315618.94 |
| 3099 | 312318.94 |
| 3100 | 309018.94 |
| 3101 | 312618.94 |
| 3102 | 314718.94 |
| 3103 | 317718.94 |
| 3104 | 320718.94 |
| 3105 | 323718.94 |
| 3106 | 325718.94 |
| 3107 | 324718.94 |
| 3108 | 319218.94 |
| 3109 | 318118.94 |
| 3110 | 319118.94 |
| 3111 | 315818.94 |
| 3112 | 310318.94 |
| 3113 | 312318.94 |
| 3114 | 315318.94 |
| 3115 | 312318.94 |
| 3116 | 315318.94 |
| 3117 | 312018.94 |
| 3118 | 308418.94 |
| 3119 | 307318.94 |
| 3120 | 312318.94 |
| 3121 | 309018.94 |
| 3122 | 311018.94 |
| 3123 | 316393.94 |
| 3124 | 319393.94 |
| 3125 | 317193.94 |
| 3126 | 320193.94 |
| 3127 | 317993.94 |
| 3128 | 315493.94 |
| 3129 | 320276.55 |
| 3130 | 321276.55 |
| 3131 | 324151.55 |
| 3132 | 326151.55 |
| 3133 | 330934.16 |
| 3134 | 333934.16 |
| 3135 | 331734.16 |
| 3136 | 327234.16 |
| 3137 | 322834.16 |
| 3138 | 321724.16 |
| 3139 | 322724.16 |
| 3140 | 325724.16 |
| 3141 | 329724.16 |
| 3142 | 332724.16 |
| 3143 | 327224.16 |
| 3144 | 331224.16 |
| 3145 | 326724.16 |
| 3146 | 329724.16 |
| 3147 | 324224.16 |
| 3148 | 320724.16 |
| 3149 | 318524.16 |
| 3150 | 320524.16 |
| 3151 | 322524.16 |
| 3152 | 321424.16 |
| 3153 | 323924.16 |
| 3154 | 318424.16 |
| 3155 | 320337.2 |
| 3156 | 323973.56 |
| 3157 | 325653.56 |
| 3158 | 322353.56 |
| 3159 | 319053.56 |
| 3160 | 322053.56 |
| 3161 | 317653.56 |
| 3162 | 312153.56 |
| 3163 | 309953.56 |
| 3164 | 307753.56 |
| 3165 | 304453.56 |
| 3166 | 300053.56 |
| 3167 | 298953.56 |
| 3168 | 301953.56 |
| 3169 | 299753.56 |
| 3170 | 302753.56 |
| 3171 | 305753.56 |
| 3172 | 307704.78 |
| 3173 | 302204.78 |
| 3174 | 300204.78 |
| 3175 | 296904.78 |
| 3176 | 291404.78 |
| 3177 | 289204.78 |
| 3178 | 293865.8 |
| 3179 | 293365.8 |
| 3180 | 293971.8 |
| 3181 | 294406.8 |
| 3182 | 295456.8 |
| 3183 | 297456.8 |
| 3184 | 299456.8 |
| 3185 | 301456.8 |
| 3186 | 299256.8 |
| 3187 | 301256.8 |
| 3188 | 304256.8 |
| 3189 | 306256.8 |
| 3190 | 308256.8 |
| 3191 | 307156.8 |
| 3192 | 302756.8 |
| 3193 | 299456.8 |
| 3194 | 300456.8 |
| 3195 | 302525.77 |
| 3196 | 300325.77 |
| 3197 | 302325.77 |
| 3198 | 300125.77 |
| 3199 | 301125.77 |
| 3200 | 298925.77 |
| 3201 | 296425.77 |
| 3202 | 293425.77 |
| 3203 | 296425.77 |
| 3204 | 301208.38 |
| 3205 | 298208.38 |
| 3206 | 300208.38 |
| 3207 | 301208.38 |
| 3208 | 299208.38 |
| 3209 | 301208.38 |
| 3210 | 302808.38 |
| 3211 | 301708.38 |
| 3212 | 303708.38 |
| 3213 | 300408.38 |
| 3214 | 298208.38 |
| 3215 | 296008.38 |
| 3216 | 296008.38 |
| 3217 | 293808.38 |
| 3218 | 298808.38 |
| 3219 | 296608.38 |
| 3220 | 299608.38 |
| 3221 | 300608.38 |
| 3222 | 298408.38 |
| 3223 | 295108.38 |
| 3224 | 298708.38 |
| 3225 | 295408.38 |
| 3226 | 298408.38 |
| 3227 | 299408.38 |
| 3228 | 297208.38 |
| 3229 | 298408.38 |
| 3230 | 301408.38 |
| 3231 | 305201.48 |
| 3232 | 307201.48 |
| 3233 | 309296.72 |
| 3234 | 311296.72 |
| 3235 | 309096.72 |
| 3236 | 307996.72 |
| 3237 | 305796.72 |
| 3238 | 303596.72 |
| 3239 | 305596.72 |
| 3240 | 308596.72 |
| 3241 | 306596.72 |
| 3242 | 305596.72 |
| 3243 | 307596.72 |
| 3244 | 304296.72 |
| 3245 | 302096.72 |
| 3246 | 297696.72 |
| 3247 | 299696.72 |
| 3248 | 296396.72 |
| 3249 | 299313.72 |
| 3250 | 300313.72 |
| 3251 | 299813.72 |
| 3252 | 302813.72 |
| 3253 | 300613.72 |
| 3254 | 295113.72 |
| 3255 | 297113.72 |
| 3256 | 293813.72 |
| 3257 | 288313.72 |
| 3258 | 291113.72 |
| 3259 | 294113.72 |
| 3260 | 296386.45 |
| 3261 | 299386.45 |
| 3262 | 297186.45 |
| 3263 | 294186.45 |
| 3264 | 297186.45 |
| 3265 | 299186.45 |
| 3266 | 300436.45 |
| 3267 | 297136.45 |
| 3268 | 297136.45 |
| 3269 | 301036.45 |
| 3270 | 303210.36 |
| 3271 | 306210.36 |
| 3272 | 307210.36 |
| 3273 | 307210.36 |
| 3274 | 305710.36 |
| 3275 | 303510.36 |
| 3276 | 306553.84 |
| 3277 | 309162.54 |
| 3278 | 312462.54 |
| 3279 | 316212.54 |
| 3280 | 321212.54 |
| 3281 | 322212.54 |
| 3282 | 325812.54 |
| 3283 | 328812.54 |
| 3284 | 326312.54 |
| 3285 | 324112.54 |
| 3286 | 326112.54 |
| 3287 | 322912.54 |
| 3288 | 325912.54 |
| 3289 | 330912.54 |
| 3290 | 332912.54 |
| 3291 | 335912.54 |
| 3292 | 338912.54 |
| 3293 | 341912.54 |
| 3294 | 343912.54 |
| 3295 | 341712.54 |
| 3296 | 338412.54 |
| 3297 | 338412.54 |
| 3298 | 332912.54 |
| 3299 | 331812.54 |
| 3300 | 328812.54 |
| 3301 | 325212.54 |
| 3302 | 321712.54 |
| 3303 | 323712.54 |
| 3304 | 320412.54 |
| 3305 | 322412.54 |
| 3306 | 322412.54 |
| 3307 | 323412.54 |
| 3308 | 326412.54 |
| 3309 | 328412.54 |
| 3310 | 325112.54 |
| 3311 | 322912.54 |
| 3312 | 319612.54 |
| 3313 | 319112.54 |
| 3314 | 321112.54 |
| 3315 | 320012.54 |
| 3316 | 323012.54 |
| 3317 | 319712.54 |
| 3318 | 322712.54 |
| 3319 | 320512.54 |
| 3320 | 320512.54 |
| 3321 | 320512.54 |
| 3322 | 317212.54 |
| 3323 | 321141.11 |
| 3324 | 317841.11 |
| 3325 | 314841.11 |
| 3326 | 311541.11 |
| 3327 | 309341.11 |
| 3328 | 312341.11 |
| 3329 | 313341.11 |
| 3330 | 316341.11 |
| 3331 | 314141.11 |
| 3332 | 309741.11 |
| 3333 | 310741.11 |
| 3334 | 308541.11 |
| 3335 | 306341.11 |
| 3336 | 309341.11 |
| 3337 | 312341.11 |
| 3338 | 310141.11 |
| 3339 | 306841.11 |
| 3340 | 308841.11 |
| 3341 | 311841.11 |
| 3342 | 314698.25 |
| 3343 | 314698.25 |
| 3344 | 312498.25 |
| 3345 | 310298.25 |
| 3346 | 306998.25 |
| 3347 | 307998.25 |
| 3348 | 305798.25 |
| 3349 | 307798.25 |
| 3350 | 310798.25 |
| 3351 | 312798.25 |
| 3352 | 309498.25 |
| 3353 | 310498.25 |
| 3354 | 313106.95 |
| 3355 | 316106.95 |
| 3356 | 321106.95 |
| 3357 | 323106.95 |
| 3358 | 326106.95 |
| 3359 | 329106.95 |
| 3360 | 325606.95 |
| 3361 | 322606.95 |
| 3362 | 323656.95 |
| 3363 | 326656.95 |
| 3364 | 323656.95 |
| 3365 | 325475.13 |
| 3366 | 328475.13 |
| 3367 | 326275.13 |
| 3368 | 329275.13 |
| 3369 | 330275.13 |
| 3370 | 333275.13 |
| 3371 | 336753.39 |
| 3372 | 338753.39 |
| 3373 | 343753.39 |
| 3374 | 342653.39 |
| 3375 | 343693.39 |
| 3376 | 345836.39 |
| 3377 | 343336.39 |
| 3378 | 346336.39 |
| 3379 | 343336.39 |
| 3380 | 340036.39 |
| 3381 | 338936.39 |
| 3382 | 335636.39 |
| 3383 | 338969.72 |
| 3384 | 336769.72 |
| 3385 | 336769.72 |
| 3386 | 334569.72 |
| 3387 | 336569.72 |
| 3388 | 339569.72 |
| 3389 | 341690.72 |
| 3390 | 338390.72 |
| 3391 | 341390.72 |
| 3392 | 342390.72 |
| 3393 | 346974.05 |
| 3394 | 344774.05 |
| 3395 | 341474.05 |
| 3396 | 344550.97 |
| 3397 | 341050.97 |
| 3398 | 343050.97 |
| 3399 | 345050.97 |
| 3400 | 348800.97 |
| 3401 | 351800.97 |
| 3402 | 351800.97 |
| 3403 | 352800.97 |
| 3404 | 355800.97 |
| 3405 | 358800.97 |
| 3406 | 361800.97 |
| 3407 | 359600.97 |
| 3408 | 361600.97 |
| 3409 | 364600.97 |
| 3410 | 361300.97 |
| 3411 | 363300.97 |
| 3412 | 364300.97 |
| 3413 | 364300.97 |
| 3414 | 364300.97 |
| 3415 | 362100.97 |
| 3416 | 359100.97 |
| 3417 | 356900.97 |
| 3418 | 355900.97 |
| 3419 | 352600.97 |
| 3420 | 356600.97 |
| 3421 | 355500.97 |
| 3422 | 358500.97 |
| 3423 | 361500.97 |
| 3424 | 358200.97 |
| 3425 | 356000.97 |
| 3426 | 358800.97 |
| 3427 | 356300.97 |
| 3428 | 359300.97 |
| 3429 | 353800.97 |
| 3430 | 356225.21 |
| 3431 | 352925.21 |
| 3432 | 349625.21 |
| 3433 | 347425.21 |
| 3434 | 351499.28 |
| 3435 | 349299.28 |
| 3436 | 351299.28 |
| 3437 | 345799.28 |
| 3438 | 346799.28 |
| 3439 | 349799.28 |
| 3440 | 354799.28 |
| 3441 | 357799.28 |
| 3442 | 355599.28 |
| 3443 | 358599.28 |
| 3444 | 356399.28 |
| 3445 | 351999.28 |
| 3446 | 353999.28 |
| 3447 | 354999.28 |
| 3448 | 356999.28 |
| 3449 | 363874.28 |
| 3450 | 360574.28 |
| 3451 | 358374.28 |
| 3452 | 355074.28 |
| 3453 | 355074.28 |
| 3454 | 359657.61 |
| 3455 | 362657.61 |
| 3456 | 362657.61 |
| 3457 | 359157.61 |
| 3458 | 362157.61 |
| 3459 | 364157.61 |
| 3460 | 358657.61 |
| 3461 | 355157.61 |
| 3462 | 360157.61 |
| 3463 | 356857.61 |
| 3464 | 359031.52 |
| 3465 | 357931.52 |
| 3466 | 353531.52 |
| 3467 | 354531.52 |
| 3468 | 357531.52 |
| 3469 | 352031.52 |
| 3470 | 352531.52 |
| 3471 | 351531.52 |
| 3472 | 350531.52 |
| 3473 | 355114.85 |
| 3474 | 354014.85 |
| 3475 | 352714.85 |
| 3476 | 351064.85 |
| 3477 | 349514.85 |
| 3478 | 350514.85 |
| 3479 | 351514.85 |
| 3480 | 352514.85 |